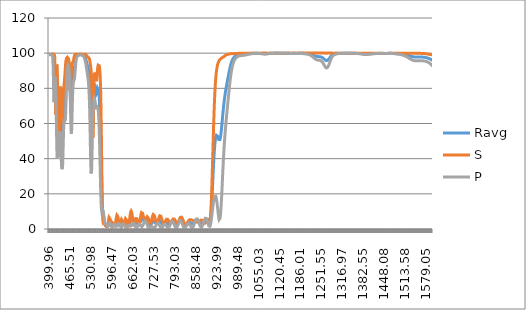
| Category | Ravg | S | P |
|---|---|---|---|
| 399.96 | 99.122 | 99.316 | 98.927 |
| 400.5 | 99.09 | 99.265 | 98.914 |
| 401.04 | 99.071 | 99.243 | 98.899 |
| 401.47 | 99.273 | 99.372 | 99.174 |
| 402.01 | 99.223 | 99.56 | 98.885 |
| 402.45 | 99.273 | 99.512 | 99.034 |
| 402.99 | 99.331 | 99.394 | 99.269 |
| 403.54 | 99.25 | 99.318 | 99.181 |
| 403.99 | 99.254 | 99.291 | 99.216 |
| 404.54 | 99.27 | 99.391 | 99.15 |
| 404.99 | 99.405 | 99.592 | 99.218 |
| 405.55 | 99.257 | 99.347 | 99.167 |
| 406.0 | 99.345 | 99.408 | 99.282 |
| 406.45 | 99.184 | 99.221 | 99.146 |
| 407.02 | 99.304 | 99.446 | 99.161 |
| 407.48 | 99.312 | 99.455 | 99.169 |
| 408.05 | 99.334 | 99.457 | 99.211 |
| 408.51 | 99.267 | 99.46 | 99.073 |
| 408.97 | 99.256 | 99.463 | 99.049 |
| 409.55 | 99.252 | 99.596 | 98.909 |
| 410.02 | 99.202 | 99.521 | 98.883 |
| 410.49 | 99.192 | 99.583 | 98.802 |
| 410.96 | 99.063 | 99.467 | 98.659 |
| 411.55 | 98.876 | 99.539 | 98.214 |
| 412.03 | 98.469 | 99.515 | 97.423 |
| 412.5 | 97.434 | 99.421 | 95.448 |
| 412.98 | 95.631 | 99.43 | 91.833 |
| 413.46 | 92.982 | 99.41 | 86.555 |
| 413.94 | 90.294 | 99.505 | 81.083 |
| 414.55 | 87.675 | 99.445 | 75.905 |
| 415.04 | 86.508 | 99.399 | 73.616 |
| 415.52 | 85.671 | 99.195 | 72.148 |
| 416.01 | 85.919 | 99.231 | 72.608 |
| 416.5 | 87.242 | 99.183 | 75.301 |
| 417.0 | 89.395 | 98.874 | 79.916 |
| 417.49 | 91.118 | 97.95 | 84.286 |
| 417.99 | 91.085 | 95.624 | 86.545 |
| 418.48 | 88.714 | 90.599 | 86.829 |
| 418.98 | 84.529 | 83.057 | 86.001 |
| 419.48 | 80.008 | 75.48 | 84.535 |
| 419.98 | 75.956 | 69.546 | 82.366 |
| 420.49 | 72.862 | 65.849 | 79.875 |
| 420.99 | 71.029 | 65.098 | 76.96 |
| 421.5 | 71.188 | 68.922 | 73.454 |
| 422.0 | 72.854 | 76.214 | 69.495 |
| 422.51 | 74.354 | 83.825 | 64.883 |
| 423.02 | 74.413 | 89.288 | 59.538 |
| 423.53 | 72.859 | 92.103 | 53.616 |
| 424.04 | 70.792 | 93.463 | 48.121 |
| 424.55 | 68.498 | 93.389 | 43.606 |
| 425.06 | 66.817 | 92.749 | 40.884 |
| 425.45 | 65.67 | 91.456 | 39.884 |
| 425.96 | 64.607 | 88.606 | 40.607 |
| 426.48 | 63.541 | 83.951 | 43.131 |
| 426.99 | 62.229 | 77.741 | 46.717 |
| 427.51 | 60.388 | 70.03 | 50.745 |
| 428.03 | 57.966 | 62.011 | 53.92 |
| 428.54 | 54.859 | 54.324 | 55.394 |
| 429.06 | 51.272 | 47.78 | 54.765 |
| 429.45 | 48.627 | 44.25 | 53.004 |
| 429.97 | 45.673 | 41.768 | 49.577 |
| 430.49 | 43.873 | 41.969 | 45.777 |
| 431.01 | 43.565 | 44.498 | 42.632 |
| 431.52 | 44.78 | 48.646 | 40.914 |
| 432.04 | 47.187 | 53.729 | 40.644 |
| 432.56 | 50.956 | 59.54 | 42.373 |
| 432.95 | 54.407 | 64.135 | 44.679 |
| 433.47 | 59.26 | 70.235 | 48.285 |
| 433.99 | 63.562 | 75.397 | 51.727 |
| 434.51 | 66.694 | 79.083 | 54.306 |
| 435.03 | 68.19 | 80.984 | 55.396 |
| 435.55 | 68.162 | 81.458 | 54.866 |
| 435.94 | 67.187 | 80.839 | 53.534 |
| 436.46 | 64.887 | 78.885 | 50.888 |
| 436.97 | 61.715 | 75.891 | 47.539 |
| 437.49 | 58.072 | 72.116 | 44.029 |
| 438.01 | 54.575 | 68.311 | 40.839 |
| 438.52 | 51.474 | 64.821 | 38.126 |
| 439.04 | 48.992 | 61.918 | 36.066 |
| 439.55 | 47.32 | 59.943 | 34.697 |
| 439.94 | 46.741 | 59.442 | 34.041 |
| 440.45 | 46.617 | 59.646 | 33.588 |
| 440.96 | 47.151 | 60.753 | 33.55 |
| 441.48 | 48.353 | 62.702 | 34.003 |
| 441.99 | 50.081 | 65.021 | 35.14 |
| 442.5 | 52.205 | 67.456 | 36.954 |
| 443.0 | 54.787 | 70.006 | 39.567 |
| 443.51 | 57.569 | 72.402 | 42.736 |
| 444.02 | 60.523 | 74.68 | 46.366 |
| 444.52 | 63.406 | 76.648 | 50.164 |
| 445.03 | 66.134 | 78.359 | 53.909 |
| 445.53 | 68.369 | 79.631 | 57.107 |
| 446.03 | 70.159 | 80.729 | 59.589 |
| 446.53 | 71.424 | 81.538 | 61.31 |
| 447.03 | 72.3 | 82.29 | 62.31 |
| 447.52 | 72.913 | 83.16 | 62.666 |
| 448.02 | 73.346 | 84.15 | 62.542 |
| 448.51 | 73.65 | 85.254 | 62.047 |
| 449.0 | 74.009 | 86.531 | 61.488 |
| 449.49 | 74.532 | 87.988 | 61.076 |
| 449.98 | 75.17 | 89.377 | 60.962 |
| 450.47 | 76.022 | 90.773 | 61.271 |
| 450.96 | 77.186 | 92.088 | 62.285 |
| 451.56 | 78.935 | 93.561 | 64.309 |
| 452.04 | 80.531 | 94.477 | 66.584 |
| 452.52 | 82.264 | 95.353 | 69.174 |
| 453.0 | 84.02 | 95.886 | 72.154 |
| 453.48 | 85.759 | 96.294 | 75.223 |
| 453.95 | 87.414 | 96.742 | 78.085 |
| 454.54 | 89.342 | 97.09 | 81.594 |
| 455.01 | 90.672 | 97.361 | 83.984 |
| 455.48 | 91.805 | 97.469 | 86.141 |
| 456.06 | 92.932 | 97.645 | 88.218 |
| 456.52 | 93.61 | 97.645 | 89.574 |
| 456.99 | 94.176 | 97.666 | 90.687 |
| 457.45 | 94.6 | 97.743 | 91.456 |
| 458.02 | 94.977 | 97.644 | 92.31 |
| 458.47 | 95.156 | 97.627 | 92.686 |
| 459.04 | 95.309 | 97.561 | 93.058 |
| 459.49 | 95.224 | 97.347 | 93.101 |
| 460.05 | 95.171 | 97.215 | 93.127 |
| 460.5 | 94.912 | 96.914 | 92.909 |
| 460.95 | 94.654 | 96.717 | 92.591 |
| 461.5 | 94.173 | 96.23 | 92.115 |
| 462.05 | 93.489 | 95.599 | 91.378 |
| 462.49 | 92.739 | 94.797 | 90.681 |
| 463.04 | 91.41 | 93.29 | 89.53 |
| 463.47 | 89.985 | 91.574 | 88.395 |
| 464.01 | 87.682 | 88.607 | 86.757 |
| 464.55 | 85.052 | 85.516 | 84.588 |
| 464.98 | 82.844 | 83.036 | 82.651 |
| 465.51 | 80.265 | 80.802 | 79.729 |
| 466.04 | 77.679 | 79.202 | 76.157 |
| 466.47 | 75.812 | 78.565 | 73.059 |
| 466.99 | 73.682 | 78.558 | 68.806 |
| 467.52 | 72.059 | 79.514 | 64.605 |
| 468.04 | 71.095 | 81.653 | 60.538 |
| 468.46 | 70.891 | 83.885 | 57.897 |
| 468.97 | 71.199 | 86.956 | 55.442 |
| 469.49 | 71.974 | 89.732 | 54.217 |
| 470.0 | 73.072 | 91.683 | 54.462 |
| 470.52 | 74.551 | 93.101 | 56.001 |
| 471.03 | 76.324 | 93.869 | 58.779 |
| 471.54 | 78.302 | 94.331 | 62.274 |
| 472.04 | 80.315 | 94.481 | 66.149 |
| 472.55 | 82.243 | 94.594 | 69.891 |
| 473.05 | 84.017 | 94.587 | 73.447 |
| 473.46 | 85.266 | 94.603 | 75.929 |
| 473.96 | 86.507 | 94.587 | 78.427 |
| 474.46 | 87.52 | 94.722 | 80.318 |
| 474.96 | 88.316 | 94.853 | 81.778 |
| 475.46 | 88.935 | 95.059 | 82.811 |
| 475.96 | 89.52 | 95.534 | 83.506 |
| 476.46 | 89.946 | 95.962 | 83.93 |
| 477.05 | 90.401 | 96.53 | 84.272 |
| 477.55 | 90.735 | 97.088 | 84.382 |
| 478.05 | 91.131 | 97.603 | 84.66 |
| 478.54 | 91.463 | 98.059 | 84.867 |
| 479.04 | 91.869 | 98.437 | 85.301 |
| 479.54 | 92.306 | 98.754 | 85.857 |
| 480.03 | 92.781 | 98.954 | 86.608 |
| 480.53 | 93.303 | 99.058 | 87.548 |
| 481.03 | 93.951 | 99.283 | 88.62 |
| 481.53 | 94.522 | 99.248 | 89.796 |
| 482.03 | 95.174 | 99.361 | 90.988 |
| 482.52 | 95.75 | 99.397 | 92.103 |
| 483.03 | 96.289 | 99.354 | 93.224 |
| 483.53 | 96.84 | 99.433 | 94.248 |
| 484.03 | 97.311 | 99.527 | 95.095 |
| 484.53 | 97.627 | 99.412 | 95.842 |
| 485.04 | 97.85 | 99.359 | 96.342 |
| 485.55 | 98.162 | 99.412 | 96.912 |
| 486.05 | 98.391 | 99.427 | 97.355 |
| 486.46 | 98.483 | 99.401 | 97.565 |
| 486.97 | 98.681 | 99.479 | 97.883 |
| 487.49 | 98.704 | 99.325 | 98.082 |
| 488.0 | 98.807 | 99.375 | 98.238 |
| 488.52 | 98.861 | 99.334 | 98.389 |
| 489.04 | 98.897 | 99.323 | 98.472 |
| 489.45 | 98.949 | 99.276 | 98.622 |
| 489.97 | 98.961 | 99.256 | 98.667 |
| 490.5 | 98.992 | 99.259 | 98.726 |
| 491.03 | 99.015 | 99.242 | 98.789 |
| 491.45 | 99.011 | 99.261 | 98.762 |
| 491.98 | 99.033 | 99.278 | 98.788 |
| 492.52 | 99.054 | 99.267 | 98.842 |
| 493.05 | 99.104 | 99.292 | 98.916 |
| 493.49 | 99.102 | 99.312 | 98.891 |
| 494.03 | 99.129 | 99.372 | 98.887 |
| 494.46 | 99.145 | 99.344 | 98.946 |
| 495.01 | 99.144 | 99.396 | 98.893 |
| 495.45 | 99.217 | 99.475 | 98.96 |
| 496.0 | 99.221 | 99.494 | 98.948 |
| 496.56 | 99.221 | 99.493 | 98.95 |
| 497.0 | 99.181 | 99.389 | 98.972 |
| 497.45 | 99.238 | 99.529 | 98.947 |
| 498.01 | 99.231 | 99.502 | 98.96 |
| 498.46 | 99.266 | 99.539 | 98.994 |
| 499.03 | 99.23 | 99.488 | 98.972 |
| 499.49 | 99.243 | 99.486 | 99 |
| 499.95 | 99.251 | 99.565 | 98.936 |
| 500.52 | 99.241 | 99.474 | 99.008 |
| 500.98 | 99.216 | 99.431 | 99.002 |
| 501.45 | 99.189 | 99.412 | 98.966 |
| 502.03 | 99.145 | 99.403 | 98.887 |
| 502.5 | 99.15 | 99.351 | 98.95 |
| 502.97 | 99.119 | 99.375 | 98.863 |
| 503.56 | 99.049 | 99.26 | 98.837 |
| 504.03 | 99.012 | 99.228 | 98.795 |
| 504.51 | 99.001 | 99.258 | 98.744 |
| 504.99 | 98.937 | 99.178 | 98.695 |
| 505.47 | 98.93 | 99.241 | 98.618 |
| 505.95 | 98.819 | 99.142 | 98.496 |
| 506.55 | 98.788 | 99.206 | 98.369 |
| 507.04 | 98.75 | 99.177 | 98.323 |
| 507.53 | 98.682 | 99.199 | 98.166 |
| 508.02 | 98.647 | 99.24 | 98.054 |
| 508.51 | 98.574 | 99.222 | 97.926 |
| 509.0 | 98.541 | 99.339 | 97.743 |
| 509.49 | 98.441 | 99.292 | 97.589 |
| 509.99 | 98.373 | 99.356 | 97.39 |
| 510.48 | 98.265 | 99.335 | 97.196 |
| 510.98 | 98.107 | 99.339 | 96.876 |
| 511.48 | 98.005 | 99.392 | 96.617 |
| 511.98 | 97.862 | 99.385 | 96.339 |
| 512.48 | 97.72 | 99.424 | 96.016 |
| 512.99 | 97.537 | 99.446 | 95.628 |
| 513.49 | 97.354 | 99.428 | 95.28 |
| 514.0 | 97.069 | 99.33 | 94.807 |
| 514.5 | 96.834 | 99.319 | 94.349 |
| 515.01 | 96.536 | 99.251 | 93.821 |
| 515.52 | 96.227 | 99.179 | 93.275 |
| 516.03 | 95.879 | 99.053 | 92.704 |
| 516.54 | 95.529 | 98.975 | 92.083 |
| 517.05 | 95.147 | 98.817 | 91.478 |
| 517.56 | 94.764 | 98.662 | 90.867 |
| 517.95 | 94.417 | 98.521 | 90.314 |
| 518.46 | 94.013 | 98.313 | 89.713 |
| 518.97 | 93.619 | 98.143 | 89.094 |
| 519.49 | 93.205 | 97.995 | 88.416 |
| 520.0 | 92.846 | 97.87 | 87.822 |
| 520.52 | 92.463 | 97.778 | 87.149 |
| 521.04 | 92.13 | 97.693 | 86.566 |
| 521.55 | 91.764 | 97.729 | 85.8 |
| 521.94 | 91.405 | 97.62 | 85.19 |
| 522.46 | 91.051 | 97.667 | 84.435 |
| 522.98 | 90.603 | 97.702 | 83.505 |
| 523.49 | 90 | 97.653 | 82.347 |
| 524.01 | 89.286 | 97.558 | 81.015 |
| 524.53 | 88.486 | 97.453 | 79.519 |
| 525.05 | 87.508 | 97.338 | 77.678 |
| 525.56 | 86.241 | 97.093 | 75.389 |
| 525.95 | 85.144 | 96.816 | 73.473 |
| 526.47 | 83.487 | 96.495 | 70.478 |
| 526.98 | 81.468 | 96.07 | 66.867 |
| 527.5 | 79.165 | 95.513 | 62.818 |
| 528.02 | 76.559 | 94.885 | 58.233 |
| 528.53 | 73.772 | 94.281 | 53.263 |
| 529.05 | 70.922 | 93.63 | 48.214 |
| 529.56 | 68.134 | 92.929 | 43.339 |
| 529.95 | 66.262 | 92.414 | 40.11 |
| 530.46 | 63.936 | 91.621 | 36.251 |
| 530.98 | 62.095 | 90.814 | 33.377 |
| 531.49 | 60.737 | 89.853 | 31.621 |
| 532.0 | 59.906 | 88.665 | 31.147 |
| 532.51 | 59.356 | 86.923 | 31.789 |
| 533.02 | 59.144 | 84.594 | 33.693 |
| 533.53 | 58.785 | 81.092 | 36.477 |
| 534.04 | 58.267 | 76.244 | 40.29 |
| 534.54 | 57.425 | 70.346 | 44.504 |
| 535.05 | 56.601 | 64.255 | 48.947 |
| 535.55 | 56.13 | 59.007 | 53.253 |
| 536.05 | 56.222 | 55.094 | 57.349 |
| 536.56 | 56.93 | 52.916 | 60.945 |
| 537.06 | 58.072 | 52.141 | 64.004 |
| 537.56 | 59.783 | 52.895 | 66.671 |
| 538.05 | 62.159 | 55.468 | 68.85 |
| 538.55 | 65.394 | 60.214 | 70.574 |
| 539.04 | 69.103 | 66.287 | 71.92 |
| 539.54 | 72.83 | 72.719 | 72.942 |
| 540.03 | 75.927 | 78.224 | 73.63 |
| 540.52 | 78.279 | 82.496 | 74.062 |
| 541.01 | 79.795 | 85.278 | 74.313 |
| 541.49 | 80.762 | 87.164 | 74.36 |
| 541.98 | 81.197 | 88.188 | 74.206 |
| 542.46 | 81.334 | 88.7 | 73.968 |
| 543.06 | 81.177 | 88.931 | 73.423 |
| 543.54 | 80.765 | 88.614 | 72.917 |
| 544.02 | 80.258 | 88.153 | 72.362 |
| 544.5 | 79.589 | 87.462 | 71.716 |
| 544.97 | 78.913 | 86.69 | 71.136 |
| 545.56 | 78.077 | 85.717 | 70.437 |
| 546.03 | 77.495 | 85.024 | 69.966 |
| 546.5 | 77.047 | 84.497 | 69.598 |
| 546.97 | 76.67 | 84.071 | 69.268 |
| 547.55 | 76.472 | 83.924 | 69.021 |
| 548.01 | 76.504 | 84.09 | 68.919 |
| 548.47 | 76.719 | 84.52 | 68.918 |
| 549.04 | 77.204 | 85.371 | 69.036 |
| 549.5 | 77.719 | 86.262 | 69.176 |
| 549.95 | 78.254 | 87.219 | 69.289 |
| 550.51 | 79.021 | 88.629 | 69.413 |
| 550.96 | 79.548 | 89.629 | 69.468 |
| 551.52 | 80.135 | 90.793 | 69.476 |
| 551.97 | 80.425 | 91.542 | 69.307 |
| 552.52 | 80.644 | 92.304 | 68.983 |
| 552.96 | 80.647 | 92.757 | 68.537 |
| 553.51 | 80.496 | 93.176 | 67.816 |
| 553.95 | 80.225 | 93.464 | 66.986 |
| 554.49 | 79.636 | 93.614 | 65.659 |
| 555.03 | 78.879 | 93.693 | 64.065 |
| 555.46 | 78.085 | 93.602 | 62.567 |
| 556.0 | 76.893 | 93.479 | 60.307 |
| 556.53 | 75.446 | 93.19 | 57.702 |
| 556.96 | 74.043 | 92.824 | 55.262 |
| 557.48 | 72.082 | 92.267 | 51.897 |
| 558.01 | 69.847 | 91.46 | 48.233 |
| 558.53 | 67.391 | 90.533 | 44.248 |
| 558.95 | 65.233 | 89.507 | 40.958 |
| 559.47 | 62.359 | 87.925 | 36.792 |
| 559.99 | 59.134 | 85.856 | 32.413 |
| 560.5 | 55.788 | 83.228 | 28.349 |
| 561.02 | 52.212 | 79.991 | 24.433 |
| 561.53 | 48.427 | 75.96 | 20.894 |
| 562.04 | 44.406 | 71.073 | 17.738 |
| 562.55 | 40.127 | 65.159 | 15.095 |
| 563.05 | 35.893 | 58.7 | 13.087 |
| 563.46 | 32.474 | 53.104 | 11.844 |
| 563.96 | 28.317 | 45.843 | 10.791 |
| 564.46 | 24.332 | 38.45 | 10.215 |
| 564.96 | 20.677 | 31.323 | 10.031 |
| 565.46 | 17.489 | 24.84 | 10.138 |
| 565.96 | 14.724 | 19.047 | 10.401 |
| 566.46 | 12.351 | 13.927 | 10.775 |
| 567.05 | 10.266 | 9.398 | 11.135 |
| 567.55 | 9.098 | 6.876 | 11.32 |
| 568.04 | 8.318 | 5.302 | 11.334 |
| 568.54 | 7.904 | 4.644 | 11.164 |
| 569.03 | 7.681 | 4.567 | 10.796 |
| 569.53 | 7.576 | 4.859 | 10.293 |
| 570.02 | 7.388 | 5.17 | 9.606 |
| 570.51 | 7.088 | 5.389 | 8.788 |
| 571.01 | 6.677 | 5.423 | 7.93 |
| 571.5 | 6.166 | 5.277 | 7.056 |
| 572.0 | 5.537 | 4.931 | 6.143 |
| 572.49 | 4.9 | 4.505 | 5.295 |
| 572.99 | 4.271 | 3.967 | 4.574 |
| 573.48 | 3.691 | 3.435 | 3.948 |
| 573.98 | 3.189 | 2.976 | 3.402 |
| 574.48 | 2.796 | 2.546 | 3.046 |
| 574.98 | 2.504 | 2.243 | 2.764 |
| 575.48 | 2.322 | 2.013 | 2.631 |
| 575.98 | 2.213 | 1.864 | 2.561 |
| 576.48 | 2.172 | 1.756 | 2.588 |
| 576.99 | 2.174 | 1.707 | 2.641 |
| 577.49 | 2.185 | 1.632 | 2.738 |
| 578.0 | 2.213 | 1.608 | 2.819 |
| 578.51 | 2.184 | 1.52 | 2.849 |
| 579.02 | 2.121 | 1.385 | 2.858 |
| 579.53 | 2.041 | 1.287 | 2.794 |
| 580.05 | 1.907 | 1.133 | 2.682 |
| 580.46 | 1.802 | 1.043 | 2.561 |
| 580.98 | 1.683 | 0.998 | 2.368 |
| 581.5 | 1.615 | 1.067 | 2.164 |
| 582.03 | 1.529 | 1.145 | 1.913 |
| 582.55 | 1.538 | 1.367 | 1.709 |
| 582.97 | 1.602 | 1.642 | 1.562 |
| 583.5 | 1.751 | 2.077 | 1.426 |
| 584.04 | 2.016 | 2.67 | 1.361 |
| 584.46 | 2.25 | 3.166 | 1.334 |
| 585.0 | 2.609 | 3.836 | 1.383 |
| 585.54 | 3.038 | 4.575 | 1.502 |
| 585.98 | 3.379 | 5.093 | 1.666 |
| 586.52 | 3.794 | 5.7 | 1.887 |
| 586.96 | 4.121 | 6.14 | 2.101 |
| 587.51 | 4.476 | 6.545 | 2.408 |
| 587.95 | 4.722 | 6.794 | 2.649 |
| 588.51 | 4.931 | 6.934 | 2.928 |
| 588.95 | 5.034 | 6.923 | 3.145 |
| 589.52 | 5.042 | 6.731 | 3.352 |
| 589.97 | 4.968 | 6.442 | 3.495 |
| 590.53 | 4.789 | 5.98 | 3.599 |
| 590.99 | 4.546 | 5.508 | 3.585 |
| 591.56 | 4.192 | 4.883 | 3.501 |
| 592.02 | 3.861 | 4.334 | 3.389 |
| 592.48 | 3.504 | 3.8 | 3.207 |
| 593.06 | 3.088 | 3.237 | 2.939 |
| 593.52 | 2.759 | 2.843 | 2.675 |
| 593.99 | 2.459 | 2.529 | 2.39 |
| 594.46 | 2.189 | 2.288 | 2.089 |
| 595.05 | 1.937 | 2.136 | 1.738 |
| 595.52 | 1.816 | 2.153 | 1.479 |
| 596.0 | 1.725 | 2.193 | 1.257 |
| 596.47 | 1.729 | 2.37 | 1.087 |
| 596.95 | 1.749 | 2.548 | 0.951 |
| 597.55 | 1.872 | 2.839 | 0.904 |
| 598.04 | 1.986 | 3.068 | 0.904 |
| 598.52 | 2.135 | 3.282 | 0.988 |
| 599.01 | 2.29 | 3.456 | 1.123 |
| 599.49 | 2.401 | 3.55 | 1.253 |
| 599.98 | 2.524 | 3.604 | 1.444 |
| 600.47 | 2.656 | 3.624 | 1.689 |
| 600.96 | 2.705 | 3.485 | 1.924 |
| 601.46 | 2.751 | 3.349 | 2.154 |
| 601.95 | 2.754 | 3.133 | 2.374 |
| 602.45 | 2.733 | 2.885 | 2.581 |
| 602.95 | 2.679 | 2.631 | 2.726 |
| 603.45 | 2.61 | 2.38 | 2.841 |
| 603.95 | 2.522 | 2.157 | 2.886 |
| 604.45 | 2.479 | 2.035 | 2.923 |
| 604.95 | 2.421 | 1.966 | 2.876 |
| 605.45 | 2.435 | 2.097 | 2.773 |
| 605.96 | 2.446 | 2.234 | 2.658 |
| 606.46 | 2.479 | 2.477 | 2.481 |
| 606.97 | 2.583 | 2.86 | 2.306 |
| 607.48 | 2.699 | 3.274 | 2.124 |
| 607.99 | 2.858 | 3.795 | 1.921 |
| 608.5 | 3.064 | 4.377 | 1.751 |
| 609.01 | 3.289 | 4.995 | 1.583 |
| 609.52 | 3.525 | 5.587 | 1.463 |
| 610.03 | 3.786 | 6.21 | 1.361 |
| 610.54 | 4.041 | 6.775 | 1.306 |
| 611.06 | 4.289 | 7.262 | 1.316 |
| 611.44 | 4.464 | 7.585 | 1.344 |
| 611.95 | 4.66 | 7.899 | 1.422 |
| 612.47 | 4.819 | 8.094 | 1.545 |
| 612.98 | 4.911 | 8.123 | 1.698 |
| 613.5 | 4.98 | 8.07 | 1.889 |
| 614.01 | 4.99 | 7.885 | 2.095 |
| 614.53 | 4.914 | 7.519 | 2.309 |
| 615.04 | 4.817 | 7.103 | 2.53 |
| 615.56 | 4.68 | 6.624 | 2.736 |
| 615.95 | 4.522 | 6.169 | 2.874 |
| 616.46 | 4.293 | 5.55 | 3.036 |
| 616.98 | 4.044 | 4.937 | 3.15 |
| 617.49 | 3.79 | 4.351 | 3.229 |
| 618.01 | 3.514 | 3.783 | 3.244 |
| 618.52 | 3.26 | 3.3 | 3.22 |
| 619.03 | 3.037 | 2.93 | 3.143 |
| 619.55 | 2.844 | 2.668 | 3.021 |
| 620.06 | 2.681 | 2.51 | 2.852 |
| 620.45 | 2.6 | 2.507 | 2.693 |
| 620.96 | 2.512 | 2.557 | 2.467 |
| 621.47 | 2.471 | 2.706 | 2.236 |
| 621.98 | 2.481 | 2.972 | 1.99 |
| 622.49 | 2.521 | 3.309 | 1.732 |
| 623.0 | 2.592 | 3.689 | 1.496 |
| 623.51 | 2.693 | 4.092 | 1.293 |
| 624.01 | 2.809 | 4.488 | 1.131 |
| 624.52 | 2.93 | 4.843 | 1.017 |
| 625.03 | 3.031 | 5.126 | 0.937 |
| 625.53 | 3.133 | 5.352 | 0.914 |
| 626.03 | 3.222 | 5.505 | 0.938 |
| 626.54 | 3.263 | 5.511 | 1.015 |
| 627.04 | 3.3 | 5.474 | 1.125 |
| 627.54 | 3.305 | 5.323 | 1.286 |
| 628.04 | 3.261 | 5.064 | 1.457 |
| 628.53 | 3.21 | 4.749 | 1.67 |
| 629.03 | 3.139 | 4.397 | 1.881 |
| 629.52 | 3.058 | 4.014 | 2.103 |
| 630.02 | 2.948 | 3.591 | 2.306 |
| 630.51 | 2.861 | 3.213 | 2.509 |
| 631.0 | 2.764 | 2.859 | 2.67 |
| 631.48 | 2.68 | 2.552 | 2.807 |
| 631.97 | 2.626 | 2.336 | 2.917 |
| 632.46 | 2.554 | 2.145 | 2.964 |
| 633.06 | 2.54 | 2.095 | 2.986 |
| 633.54 | 2.556 | 2.156 | 2.956 |
| 634.02 | 2.587 | 2.294 | 2.881 |
| 634.5 | 2.638 | 2.51 | 2.765 |
| 634.97 | 2.711 | 2.794 | 2.627 |
| 635.45 | 2.814 | 3.169 | 2.459 |
| 636.04 | 2.96 | 3.68 | 2.239 |
| 636.51 | 3.062 | 4.085 | 2.038 |
| 636.98 | 3.177 | 4.505 | 1.848 |
| 637.56 | 3.291 | 4.981 | 1.601 |
| 638.02 | 3.376 | 5.339 | 1.414 |
| 638.48 | 3.444 | 5.636 | 1.252 |
| 639.06 | 3.496 | 5.913 | 1.078 |
| 639.52 | 3.504 | 6.04 | 0.967 |
| 639.97 | 3.494 | 6.107 | 0.88 |
| 640.54 | 3.434 | 6.07 | 0.798 |
| 640.99 | 3.366 | 5.942 | 0.79 |
| 641.55 | 3.267 | 5.736 | 0.798 |
| 642.0 | 3.148 | 5.475 | 0.82 |
| 642.55 | 2.978 | 5.057 | 0.899 |
| 643.0 | 2.829 | 4.683 | 0.976 |
| 643.55 | 2.642 | 4.191 | 1.093 |
| 643.99 | 2.488 | 3.779 | 1.197 |
| 644.53 | 2.313 | 3.291 | 1.335 |
| 644.97 | 2.183 | 2.914 | 1.452 |
| 645.51 | 2.042 | 2.482 | 1.603 |
| 646.05 | 1.941 | 2.148 | 1.733 |
| 646.47 | 1.877 | 1.919 | 1.836 |
| 647.01 | 1.864 | 1.786 | 1.942 |
| 647.54 | 1.883 | 1.741 | 2.026 |
| 647.96 | 1.945 | 1.808 | 2.082 |
| 648.48 | 2.057 | 1.987 | 2.127 |
| 649.01 | 2.231 | 2.333 | 2.129 |
| 649.53 | 2.452 | 2.766 | 2.137 |
| 650.05 | 2.7 | 3.286 | 2.114 |
| 650.46 | 2.932 | 3.784 | 2.08 |
| 650.97 | 3.235 | 4.444 | 2.026 |
| 651.49 | 3.551 | 5.146 | 1.956 |
| 652.0 | 3.9 | 5.915 | 1.884 |
| 652.51 | 4.238 | 6.663 | 1.814 |
| 653.01 | 4.563 | 7.381 | 1.744 |
| 653.52 | 4.86 | 8.043 | 1.676 |
| 654.02 | 5.135 | 8.638 | 1.633 |
| 654.52 | 5.388 | 9.171 | 1.605 |
| 655.02 | 5.609 | 9.622 | 1.596 |
| 655.52 | 5.772 | 9.95 | 1.594 |
| 656.02 | 5.884 | 10.129 | 1.639 |
| 656.51 | 5.946 | 10.201 | 1.691 |
| 657.01 | 5.975 | 10.173 | 1.778 |
| 657.5 | 5.951 | 10.016 | 1.887 |
| 658.0 | 5.877 | 9.752 | 2.001 |
| 658.49 | 5.75 | 9.365 | 2.134 |
| 658.98 | 5.597 | 8.909 | 2.285 |
| 659.47 | 5.398 | 8.345 | 2.45 |
| 659.96 | 5.181 | 7.76 | 2.602 |
| 660.55 | 4.888 | 6.99 | 2.786 |
| 661.04 | 4.632 | 6.337 | 2.927 |
| 661.53 | 4.372 | 5.707 | 3.037 |
| 662.03 | 4.111 | 5.079 | 3.143 |
| 662.52 | 3.855 | 4.478 | 3.232 |
| 663.01 | 3.623 | 3.975 | 3.272 |
| 663.5 | 3.408 | 3.53 | 3.286 |
| 663.99 | 3.241 | 3.186 | 3.297 |
| 664.49 | 3.084 | 2.934 | 3.234 |
| 664.98 | 2.96 | 2.781 | 3.138 |
| 665.48 | 2.898 | 2.755 | 3.041 |
| 665.97 | 2.855 | 2.805 | 2.904 |
| 666.47 | 2.839 | 2.95 | 2.728 |
| 666.97 | 2.844 | 3.154 | 2.535 |
| 667.47 | 2.891 | 3.452 | 2.33 |
| 667.97 | 2.961 | 3.806 | 2.116 |
| 668.47 | 3.04 | 4.198 | 1.882 |
| 668.98 | 3.123 | 4.582 | 1.663 |
| 669.48 | 3.21 | 4.977 | 1.443 |
| 669.99 | 3.302 | 5.349 | 1.256 |
| 670.5 | 3.365 | 5.661 | 1.07 |
| 671.01 | 3.438 | 5.951 | 0.925 |
| 671.53 | 3.482 | 6.161 | 0.802 |
| 672.05 | 3.5 | 6.283 | 0.717 |
| 672.46 | 3.503 | 6.336 | 0.67 |
| 672.98 | 3.49 | 6.323 | 0.658 |
| 673.5 | 3.438 | 6.197 | 0.679 |
| 674.03 | 3.371 | 6.015 | 0.727 |
| 674.45 | 3.319 | 5.834 | 0.805 |
| 674.98 | 3.233 | 5.536 | 0.93 |
| 675.52 | 3.131 | 5.18 | 1.082 |
| 676.05 | 3.027 | 4.787 | 1.266 |
| 676.48 | 2.932 | 4.459 | 1.406 |
| 677.02 | 2.825 | 4.04 | 1.61 |
| 677.46 | 2.735 | 3.703 | 1.767 |
| 678.0 | 2.657 | 3.345 | 1.969 |
| 678.55 | 2.57 | 2.985 | 2.155 |
| 678.99 | 2.545 | 2.788 | 2.302 |
| 679.54 | 2.537 | 2.613 | 2.461 |
| 679.99 | 2.541 | 2.504 | 2.577 |
| 680.55 | 2.591 | 2.501 | 2.681 |
| 681.0 | 2.661 | 2.568 | 2.753 |
| 681.45 | 2.748 | 2.711 | 2.785 |
| 682.01 | 2.88 | 2.946 | 2.814 |
| 682.47 | 3.022 | 3.257 | 2.788 |
| 683.04 | 3.218 | 3.719 | 2.717 |
| 683.5 | 3.412 | 4.145 | 2.679 |
| 683.96 | 3.594 | 4.624 | 2.564 |
| 684.54 | 3.848 | 5.253 | 2.443 |
| 685.01 | 4.064 | 5.818 | 2.31 |
| 685.47 | 4.255 | 6.332 | 2.178 |
| 686.06 | 4.498 | 6.986 | 2.01 |
| 686.53 | 4.671 | 7.489 | 1.853 |
| 687.01 | 4.82 | 7.915 | 1.726 |
| 687.48 | 4.974 | 8.36 | 1.588 |
| 687.96 | 5.098 | 8.714 | 1.483 |
| 688.56 | 5.218 | 9.07 | 1.366 |
| 689.04 | 5.317 | 9.328 | 1.305 |
| 689.52 | 5.383 | 9.494 | 1.271 |
| 690.0 | 5.408 | 9.56 | 1.255 |
| 690.49 | 5.422 | 9.567 | 1.277 |
| 690.98 | 5.407 | 9.497 | 1.317 |
| 691.46 | 5.383 | 9.359 | 1.407 |
| 691.96 | 5.35 | 9.165 | 1.535 |
| 692.45 | 5.292 | 8.908 | 1.676 |
| 693.06 | 5.215 | 8.535 | 1.894 |
| 693.56 | 5.122 | 8.151 | 2.094 |
| 694.05 | 5.05 | 7.791 | 2.31 |
| 694.55 | 4.979 | 7.405 | 2.553 |
| 695.05 | 4.896 | 7.001 | 2.791 |
| 695.55 | 4.829 | 6.626 | 3.032 |
| 696.05 | 4.757 | 6.245 | 3.27 |
| 696.55 | 4.702 | 5.89 | 3.514 |
| 697.06 | 4.668 | 5.592 | 3.744 |
| 697.56 | 4.638 | 5.334 | 3.942 |
| 697.94 | 4.621 | 5.168 | 4.074 |
| 698.44 | 4.62 | 5.001 | 4.239 |
| 698.95 | 4.627 | 4.874 | 4.38 |
| 699.46 | 4.65 | 4.821 | 4.48 |
| 699.97 | 4.687 | 4.83 | 4.543 |
| 700.48 | 4.72 | 4.868 | 4.573 |
| 700.98 | 4.78 | 4.985 | 4.575 |
| 701.49 | 4.837 | 5.136 | 4.538 |
| 702.01 | 4.884 | 5.322 | 4.446 |
| 702.52 | 4.935 | 5.532 | 4.338 |
| 703.03 | 4.968 | 5.754 | 4.181 |
| 703.54 | 5.001 | 5.989 | 4.013 |
| 704.05 | 5 | 6.216 | 3.784 |
| 704.56 | 5 | 6.433 | 3.566 |
| 704.95 | 4.991 | 6.609 | 3.372 |
| 705.46 | 4.947 | 6.782 | 3.113 |
| 705.97 | 4.881 | 6.923 | 2.84 |
| 706.49 | 4.793 | 7.02 | 2.567 |
| 707.0 | 4.683 | 7.081 | 2.285 |
| 707.51 | 4.538 | 7.066 | 2.009 |
| 708.02 | 4.385 | 7.025 | 1.745 |
| 708.54 | 4.199 | 6.899 | 1.499 |
| 709.05 | 4.006 | 6.74 | 1.272 |
| 709.56 | 3.796 | 6.515 | 1.077 |
| 709.94 | 3.631 | 6.331 | 0.931 |
| 710.45 | 3.418 | 6.051 | 0.785 |
| 710.96 | 3.189 | 5.729 | 0.649 |
| 711.47 | 2.966 | 5.372 | 0.559 |
| 711.98 | 2.755 | 5.031 | 0.48 |
| 712.49 | 2.556 | 4.662 | 0.449 |
| 713.0 | 2.374 | 4.3 | 0.449 |
| 713.5 | 2.221 | 3.985 | 0.457 |
| 714.01 | 2.08 | 3.659 | 0.501 |
| 714.52 | 1.976 | 3.391 | 0.562 |
| 715.02 | 1.923 | 3.187 | 0.658 |
| 715.52 | 1.882 | 3.031 | 0.733 |
| 716.03 | 1.877 | 2.93 | 0.824 |
| 716.53 | 1.914 | 2.904 | 0.924 |
| 717.03 | 1.99 | 2.948 | 1.032 |
| 717.52 | 2.078 | 3.043 | 1.114 |
| 718.02 | 2.198 | 3.194 | 1.202 |
| 718.52 | 2.345 | 3.424 | 1.267 |
| 719.01 | 2.509 | 3.69 | 1.327 |
| 719.51 | 2.703 | 4.032 | 1.375 |
| 720.0 | 2.907 | 4.406 | 1.409 |
| 720.49 | 3.101 | 4.795 | 1.407 |
| 720.98 | 3.3 | 5.189 | 1.41 |
| 721.46 | 3.506 | 5.614 | 1.398 |
| 721.95 | 3.699 | 6.039 | 1.36 |
| 722.56 | 3.926 | 6.555 | 1.298 |
| 723.04 | 4.074 | 6.909 | 1.238 |
| 723.52 | 4.215 | 7.259 | 1.171 |
| 724.0 | 4.332 | 7.571 | 1.093 |
| 724.47 | 4.42 | 7.816 | 1.024 |
| 724.95 | 4.487 | 8.034 | 0.941 |
| 725.54 | 4.541 | 8.228 | 0.854 |
| 726.01 | 4.552 | 8.32 | 0.784 |
| 726.48 | 4.561 | 8.367 | 0.755 |
| 726.95 | 4.513 | 8.337 | 0.689 |
| 727.53 | 4.444 | 8.225 | 0.664 |
| 728.0 | 4.389 | 8.115 | 0.663 |
| 728.46 | 4.313 | 7.958 | 0.668 |
| 729.03 | 4.177 | 7.661 | 0.694 |
| 729.49 | 4.072 | 7.384 | 0.761 |
| 730.06 | 3.946 | 7.042 | 0.849 |
| 730.51 | 3.82 | 6.719 | 0.92 |
| 730.96 | 3.71 | 6.399 | 1.021 |
| 731.52 | 3.568 | 5.975 | 1.16 |
| 731.97 | 3.468 | 5.643 | 1.294 |
| 732.52 | 3.332 | 5.201 | 1.463 |
| 732.97 | 3.261 | 4.907 | 1.615 |
| 733.52 | 3.173 | 4.544 | 1.803 |
| 733.96 | 3.109 | 4.264 | 1.955 |
| 734.5 | 3.061 | 3.978 | 2.145 |
| 735.04 | 3.034 | 3.727 | 2.341 |
| 735.47 | 3.02 | 3.578 | 2.462 |
| 736.01 | 3.035 | 3.428 | 2.642 |
| 736.55 | 3.08 | 3.351 | 2.81 |
| 736.97 | 3.118 | 3.302 | 2.933 |
| 737.5 | 3.19 | 3.312 | 3.068 |
| 738.03 | 3.274 | 3.399 | 3.149 |
| 738.55 | 3.393 | 3.537 | 3.25 |
| 738.97 | 3.475 | 3.665 | 3.286 |
| 739.49 | 3.617 | 3.913 | 3.321 |
| 740.01 | 3.741 | 4.15 | 3.331 |
| 740.52 | 3.884 | 4.451 | 3.317 |
| 741.03 | 4.029 | 4.786 | 3.272 |
| 741.54 | 4.155 | 5.095 | 3.216 |
| 742.05 | 4.264 | 5.413 | 3.114 |
| 742.46 | 4.371 | 5.713 | 3.028 |
| 742.96 | 4.467 | 6.034 | 2.9 |
| 743.47 | 4.55 | 6.355 | 2.745 |
| 743.97 | 4.63 | 6.659 | 2.601 |
| 744.47 | 4.669 | 6.925 | 2.413 |
| 744.96 | 4.698 | 7.164 | 2.231 |
| 745.46 | 4.697 | 7.354 | 2.041 |
| 745.96 | 4.672 | 7.499 | 1.845 |
| 746.55 | 4.621 | 7.63 | 1.613 |
| 747.04 | 4.578 | 7.717 | 1.439 |
| 747.53 | 4.492 | 7.713 | 1.27 |
| 748.02 | 4.384 | 7.663 | 1.104 |
| 748.51 | 4.276 | 7.572 | 0.979 |
| 749.0 | 4.152 | 7.452 | 0.852 |
| 749.49 | 4.014 | 7.288 | 0.741 |
| 749.98 | 3.869 | 7.073 | 0.664 |
| 750.47 | 3.734 | 6.858 | 0.611 |
| 751.05 | 3.531 | 6.477 | 0.585 |
| 751.54 | 3.382 | 6.181 | 0.583 |
| 752.03 | 3.225 | 5.842 | 0.607 |
| 752.51 | 3.09 | 5.52 | 0.66 |
| 753.0 | 2.962 | 5.187 | 0.737 |
| 753.49 | 2.835 | 4.837 | 0.834 |
| 753.98 | 2.732 | 4.504 | 0.959 |
| 754.47 | 2.633 | 4.186 | 1.08 |
| 754.96 | 2.579 | 3.924 | 1.235 |
| 755.55 | 2.516 | 3.611 | 1.422 |
| 756.04 | 2.473 | 3.367 | 1.578 |
| 756.53 | 2.452 | 3.151 | 1.753 |
| 757.03 | 2.474 | 3.025 | 1.923 |
| 757.52 | 2.488 | 2.895 | 2.081 |
| 758.02 | 2.546 | 2.839 | 2.252 |
| 758.52 | 2.593 | 2.8 | 2.386 |
| 759.02 | 2.673 | 2.83 | 2.515 |
| 759.52 | 2.755 | 2.889 | 2.621 |
| 760.02 | 2.853 | 2.99 | 2.717 |
| 760.53 | 2.958 | 3.124 | 2.791 |
| 761.04 | 3.056 | 3.281 | 2.83 |
| 761.55 | 3.155 | 3.458 | 2.851 |
| 761.95 | 3.252 | 3.646 | 2.857 |
| 762.47 | 3.344 | 3.855 | 2.832 |
| 762.98 | 3.43 | 4.082 | 2.777 |
| 763.5 | 3.505 | 4.308 | 2.702 |
| 764.02 | 3.574 | 4.544 | 2.604 |
| 764.55 | 3.629 | 4.768 | 2.491 |
| 764.97 | 3.662 | 4.945 | 2.38 |
| 765.49 | 3.673 | 5.123 | 2.222 |
| 766.02 | 3.69 | 5.301 | 2.078 |
| 766.45 | 3.675 | 5.422 | 1.928 |
| 766.98 | 3.638 | 5.536 | 1.741 |
| 767.52 | 3.6 | 5.627 | 1.573 |
| 767.95 | 3.547 | 5.67 | 1.423 |
| 768.5 | 3.487 | 5.729 | 1.246 |
| 769.04 | 3.413 | 5.741 | 1.085 |
| 769.48 | 3.334 | 5.708 | 0.96 |
| 770.03 | 3.23 | 5.632 | 0.827 |
| 770.48 | 3.142 | 5.548 | 0.735 |
| 771.03 | 3.035 | 5.433 | 0.637 |
| 771.48 | 2.953 | 5.322 | 0.584 |
| 772.04 | 2.856 | 5.161 | 0.551 |
| 772.49 | 2.77 | 4.996 | 0.545 |
| 772.95 | 2.711 | 4.867 | 0.556 |
| 773.52 | 2.637 | 4.651 | 0.623 |
| 773.97 | 2.595 | 4.498 | 0.691 |
| 774.55 | 2.565 | 4.322 | 0.809 |
| 775.01 | 2.548 | 4.167 | 0.929 |
| 775.47 | 2.548 | 4.029 | 1.067 |
| 776.05 | 2.572 | 3.859 | 1.286 |
| 776.52 | 2.61 | 3.761 | 1.459 |
| 776.99 | 2.66 | 3.652 | 1.667 |
| 777.46 | 2.729 | 3.594 | 1.863 |
| 778.05 | 2.84 | 3.539 | 2.141 |
| 778.53 | 2.949 | 3.523 | 2.375 |
| 779.01 | 3.065 | 3.537 | 2.592 |
| 779.49 | 3.179 | 3.548 | 2.809 |
| 779.97 | 3.325 | 3.614 | 3.036 |
| 780.45 | 3.475 | 3.706 | 3.245 |
| 781.05 | 3.656 | 3.818 | 3.494 |
| 781.54 | 3.793 | 3.921 | 3.664 |
| 782.02 | 3.951 | 4.063 | 3.839 |
| 782.51 | 4.086 | 4.203 | 3.969 |
| 783.0 | 4.234 | 4.371 | 4.098 |
| 783.49 | 4.367 | 4.54 | 4.194 |
| 783.99 | 4.491 | 4.707 | 4.275 |
| 784.48 | 4.591 | 4.864 | 4.318 |
| 784.97 | 4.674 | 5.027 | 4.321 |
| 785.47 | 4.754 | 5.193 | 4.315 |
| 785.97 | 4.809 | 5.34 | 4.278 |
| 786.47 | 4.844 | 5.486 | 4.203 |
| 786.97 | 4.854 | 5.601 | 4.106 |
| 787.47 | 4.835 | 5.688 | 3.982 |
| 787.97 | 4.805 | 5.78 | 3.83 |
| 788.47 | 4.745 | 5.823 | 3.666 |
| 788.97 | 4.67 | 5.868 | 3.472 |
| 789.48 | 4.568 | 5.86 | 3.275 |
| 789.98 | 4.459 | 5.864 | 3.054 |
| 790.49 | 4.322 | 5.82 | 2.823 |
| 791.0 | 4.179 | 5.753 | 2.606 |
| 791.5 | 4.014 | 5.655 | 2.373 |
| 792.01 | 3.841 | 5.546 | 2.135 |
| 792.52 | 3.648 | 5.405 | 1.891 |
| 793.03 | 3.481 | 5.287 | 1.674 |
| 793.53 | 3.302 | 5.145 | 1.46 |
| 794.04 | 3.112 | 4.949 | 1.274 |
| 794.55 | 2.933 | 4.771 | 1.095 |
| 795.06 | 2.765 | 4.588 | 0.942 |
| 795.44 | 2.647 | 4.449 | 0.845 |
| 795.95 | 2.506 | 4.268 | 0.743 |
| 796.46 | 2.369 | 4.075 | 0.664 |
| 796.97 | 2.259 | 3.905 | 0.613 |
| 797.48 | 2.179 | 3.757 | 0.601 |
| 797.99 | 2.124 | 3.637 | 0.61 |
| 798.5 | 2.094 | 3.517 | 0.671 |
| 799.01 | 2.091 | 3.424 | 0.758 |
| 799.52 | 2.117 | 3.35 | 0.884 |
| 800.03 | 2.163 | 3.31 | 1.015 |
| 800.54 | 2.244 | 3.311 | 1.177 |
| 801.04 | 2.352 | 3.318 | 1.386 |
| 801.55 | 2.482 | 3.358 | 1.607 |
| 802.05 | 2.633 | 3.438 | 1.828 |
| 802.56 | 2.807 | 3.539 | 2.075 |
| 803.06 | 3 | 3.657 | 2.343 |
| 803.44 | 3.156 | 3.78 | 2.532 |
| 803.95 | 3.362 | 3.933 | 2.792 |
| 804.45 | 3.591 | 4.112 | 3.069 |
| 804.95 | 3.828 | 4.351 | 3.305 |
| 805.45 | 4.059 | 4.559 | 3.558 |
| 805.95 | 4.292 | 4.792 | 3.792 |
| 806.45 | 4.511 | 5.007 | 4.016 |
| 806.94 | 4.724 | 5.232 | 4.216 |
| 807.56 | 4.972 | 5.522 | 4.422 |
| 808.06 | 5.165 | 5.749 | 4.582 |
| 808.55 | 5.319 | 5.948 | 4.69 |
| 809.04 | 5.459 | 6.13 | 4.788 |
| 809.53 | 5.592 | 6.332 | 4.851 |
| 810.02 | 5.666 | 6.46 | 4.871 |
| 810.51 | 5.734 | 6.591 | 4.878 |
| 811.0 | 5.767 | 6.682 | 4.851 |
| 811.48 | 5.772 | 6.763 | 4.781 |
| 811.96 | 5.766 | 6.826 | 4.705 |
| 812.56 | 5.712 | 6.859 | 4.566 |
| 813.04 | 5.626 | 6.828 | 4.425 |
| 813.52 | 5.522 | 6.786 | 4.259 |
| 814.0 | 5.41 | 6.741 | 4.08 |
| 814.47 | 5.261 | 6.643 | 3.878 |
| 815.06 | 5.061 | 6.499 | 3.623 |
| 815.53 | 4.877 | 6.373 | 3.381 |
| 816.0 | 4.683 | 6.202 | 3.164 |
| 816.46 | 4.484 | 6.039 | 2.928 |
| 817.05 | 4.222 | 5.803 | 2.641 |
| 817.51 | 3.992 | 5.585 | 2.398 |
| 817.97 | 3.784 | 5.387 | 2.18 |
| 818.54 | 3.52 | 5.122 | 1.917 |
| 819.0 | 3.308 | 4.918 | 1.698 |
| 819.45 | 3.1 | 4.685 | 1.515 |
| 820.02 | 2.864 | 4.421 | 1.307 |
| 820.47 | 2.681 | 4.207 | 1.155 |
| 821.03 | 2.48 | 3.966 | 0.993 |
| 821.47 | 2.317 | 3.759 | 0.876 |
| 822.03 | 2.144 | 3.534 | 0.753 |
| 822.47 | 2.02 | 3.354 | 0.686 |
| 823.02 | 1.906 | 3.185 | 0.628 |
| 823.45 | 1.831 | 3.067 | 0.596 |
| 824.0 | 1.754 | 2.902 | 0.606 |
| 824.54 | 1.723 | 2.811 | 0.634 |
| 824.97 | 1.698 | 2.719 | 0.677 |
| 825.5 | 1.704 | 2.665 | 0.742 |
| 826.03 | 1.715 | 2.6 | 0.83 |
| 826.46 | 1.761 | 2.602 | 0.92 |
| 826.99 | 1.806 | 2.575 | 1.038 |
| 827.51 | 1.895 | 2.611 | 1.179 |
| 828.03 | 2.01 | 2.663 | 1.357 |
| 828.55 | 2.122 | 2.726 | 1.519 |
| 828.97 | 2.213 | 2.785 | 1.642 |
| 829.48 | 2.343 | 2.879 | 1.808 |
| 830.0 | 2.489 | 2.987 | 1.991 |
| 830.51 | 2.629 | 3.1 | 2.158 |
| 831.01 | 2.787 | 3.247 | 2.327 |
| 831.52 | 2.933 | 3.389 | 2.476 |
| 832.02 | 3.083 | 3.531 | 2.635 |
| 832.53 | 3.229 | 3.694 | 2.764 |
| 833.03 | 3.37 | 3.849 | 2.891 |
| 833.52 | 3.493 | 4.005 | 2.981 |
| 834.02 | 3.593 | 4.135 | 3.051 |
| 834.52 | 3.713 | 4.298 | 3.128 |
| 835.01 | 3.813 | 4.458 | 3.168 |
| 835.5 | 3.878 | 4.553 | 3.203 |
| 835.99 | 3.943 | 4.693 | 3.193 |
| 836.48 | 3.991 | 4.809 | 3.174 |
| 836.97 | 4.04 | 4.931 | 3.149 |
| 837.46 | 4.049 | 5.01 | 3.087 |
| 838.04 | 4.05 | 5.121 | 2.98 |
| 838.53 | 4.031 | 5.181 | 2.881 |
| 839.01 | 4.003 | 5.237 | 2.77 |
| 839.5 | 3.955 | 5.27 | 2.64 |
| 839.98 | 3.906 | 5.318 | 2.494 |
| 840.46 | 3.829 | 5.326 | 2.333 |
| 841.04 | 3.763 | 5.388 | 2.138 |
| 841.53 | 3.68 | 5.389 | 1.972 |
| 842.01 | 3.602 | 5.379 | 1.824 |
| 842.49 | 3.501 | 5.358 | 1.643 |
| 842.98 | 3.415 | 5.351 | 1.479 |
| 843.46 | 3.324 | 5.333 | 1.314 |
| 844.04 | 3.232 | 5.304 | 1.161 |
| 844.53 | 3.144 | 5.259 | 1.029 |
| 845.02 | 3.059 | 5.2 | 0.918 |
| 845.5 | 2.997 | 5.178 | 0.816 |
| 845.99 | 2.944 | 5.128 | 0.759 |
| 846.48 | 2.911 | 5.112 | 0.71 |
| 846.97 | 2.874 | 5.077 | 0.671 |
| 847.46 | 2.853 | 5.034 | 0.672 |
| 847.96 | 2.829 | 4.965 | 0.694 |
| 848.55 | 2.845 | 4.929 | 0.76 |
| 849.05 | 2.867 | 4.872 | 0.862 |
| 849.55 | 2.91 | 4.852 | 0.968 |
| 850.05 | 2.977 | 4.833 | 1.12 |
| 850.55 | 3.036 | 4.794 | 1.279 |
| 850.96 | 3.095 | 4.752 | 1.439 |
| 851.46 | 3.192 | 4.726 | 1.658 |
| 851.97 | 3.283 | 4.681 | 1.884 |
| 852.48 | 3.393 | 4.655 | 2.131 |
| 852.99 | 3.501 | 4.607 | 2.394 |
| 853.51 | 3.627 | 4.572 | 2.682 |
| 854.03 | 3.751 | 4.539 | 2.962 |
| 854.55 | 3.889 | 4.521 | 3.257 |
| 854.97 | 3.966 | 4.454 | 3.478 |
| 855.49 | 4.099 | 4.431 | 3.767 |
| 856.02 | 4.222 | 4.38 | 4.064 |
| 856.55 | 4.334 | 4.33 | 4.339 |
| 856.98 | 4.419 | 4.295 | 4.544 |
| 857.51 | 4.53 | 4.257 | 4.802 |
| 858.05 | 4.62 | 4.21 | 5.031 |
| 858.48 | 4.688 | 4.168 | 5.208 |
| 859.03 | 4.744 | 4.102 | 5.387 |
| 859.46 | 4.796 | 4.076 | 5.517 |
| 860.01 | 4.842 | 4.027 | 5.657 |
| 860.45 | 4.867 | 3.994 | 5.741 |
| 861.01 | 4.898 | 3.959 | 5.837 |
| 861.45 | 4.911 | 3.952 | 5.869 |
| 862.01 | 4.885 | 3.886 | 5.884 |
| 862.46 | 4.878 | 3.887 | 5.869 |
| 863.02 | 4.835 | 3.862 | 5.809 |
| 863.48 | 4.801 | 3.868 | 5.734 |
| 864.05 | 4.733 | 3.869 | 5.597 |
| 864.51 | 4.667 | 3.859 | 5.474 |
| 864.97 | 4.602 | 3.881 | 5.323 |
| 865.54 | 4.514 | 3.924 | 5.105 |
| 866.01 | 4.429 | 3.945 | 4.914 |
| 866.47 | 4.349 | 3.991 | 4.708 |
| 867.06 | 4.242 | 4.064 | 4.421 |
| 867.53 | 4.114 | 4.074 | 4.155 |
| 868.0 | 4.039 | 4.166 | 3.912 |
| 868.47 | 3.939 | 4.21 | 3.667 |
| 868.95 | 3.836 | 4.282 | 3.389 |
| 869.54 | 3.719 | 4.387 | 3.051 |
| 870.02 | 3.606 | 4.43 | 2.783 |
| 870.5 | 3.531 | 4.522 | 2.54 |
| 870.98 | 3.452 | 4.61 | 2.293 |
| 871.47 | 3.359 | 4.671 | 2.046 |
| 871.95 | 3.307 | 4.78 | 1.834 |
| 872.56 | 3.231 | 4.851 | 1.61 |
| 873.05 | 3.17 | 4.918 | 1.422 |
| 873.54 | 3.119 | 4.94 | 1.299 |
| 874.03 | 3.094 | 5.028 | 1.16 |
| 874.52 | 3.061 | 5.053 | 1.069 |
| 875.01 | 3.048 | 5.082 | 1.015 |
| 875.5 | 3.023 | 5.078 | 0.967 |
| 876.0 | 3.037 | 5.078 | 0.996 |
| 876.5 | 3.045 | 5.06 | 1.03 |
| 876.99 | 3.06 | 5.024 | 1.096 |
| 877.49 | 3.083 | 4.978 | 1.189 |
| 877.99 | 3.127 | 4.937 | 1.317 |
| 878.49 | 3.16 | 4.827 | 1.493 |
| 878.99 | 3.209 | 4.749 | 1.669 |
| 879.49 | 3.274 | 4.665 | 1.883 |
| 880.0 | 3.337 | 4.559 | 2.115 |
| 880.5 | 3.401 | 4.44 | 2.363 |
| 881.0 | 3.484 | 4.331 | 2.638 |
| 881.51 | 3.554 | 4.194 | 2.914 |
| 882.01 | 3.655 | 4.099 | 3.21 |
| 882.52 | 3.729 | 3.936 | 3.523 |
| 883.02 | 3.816 | 3.807 | 3.824 |
| 883.53 | 3.894 | 3.683 | 4.105 |
| 884.03 | 3.989 | 3.583 | 4.394 |
| 884.54 | 4.107 | 3.522 | 4.691 |
| 885.04 | 4.184 | 3.409 | 4.96 |
| 885.55 | 4.275 | 3.342 | 5.207 |
| 886.06 | 4.373 | 3.297 | 5.45 |
| 886.56 | 4.458 | 3.256 | 5.66 |
| 886.94 | 4.545 | 3.275 | 5.816 |
| 887.45 | 4.649 | 3.307 | 5.99 |
| 887.95 | 4.691 | 3.298 | 6.085 |
| 888.46 | 4.796 | 3.389 | 6.204 |
| 888.97 | 4.864 | 3.474 | 6.254 |
| 889.47 | 4.94 | 3.593 | 6.287 |
| 889.97 | 5 | 3.713 | 6.287 |
| 890.48 | 5.052 | 3.852 | 6.251 |
| 890.98 | 5.095 | 4.03 | 6.161 |
| 891.48 | 5.107 | 4.171 | 6.042 |
| 891.99 | 5.149 | 4.392 | 5.907 |
| 892.49 | 5.135 | 4.572 | 5.698 |
| 892.99 | 5.137 | 4.778 | 5.497 |
| 893.49 | 5.087 | 4.938 | 5.237 |
| 893.99 | 5.039 | 5.096 | 4.982 |
| 894.48 | 4.961 | 5.241 | 4.682 |
| 894.98 | 4.887 | 5.374 | 4.401 |
| 895.48 | 4.757 | 5.452 | 4.063 |
| 895.97 | 4.639 | 5.517 | 3.761 |
| 896.46 | 4.482 | 5.543 | 3.422 |
| 896.96 | 4.324 | 5.556 | 3.093 |
| 897.45 | 4.14 | 5.498 | 2.781 |
| 898.06 | 3.895 | 5.386 | 2.403 |
| 898.55 | 3.717 | 5.279 | 2.155 |
| 899.03 | 3.52 | 5.131 | 1.909 |
| 899.52 | 3.337 | 4.977 | 1.697 |
| 900.0 | 3.173 | 4.822 | 1.524 |
| 900.48 | 3.026 | 4.657 | 1.396 |
| 900.96 | 2.962 | 4.597 | 1.328 |
| 901.56 | 2.914 | 4.551 | 1.277 |
| 902.04 | 2.96 | 4.598 | 1.322 |
| 902.51 | 3.063 | 4.726 | 1.401 |
| 902.99 | 3.288 | 5.012 | 1.563 |
| 903.46 | 3.626 | 5.469 | 1.782 |
| 904.05 | 4.186 | 6.232 | 2.141 |
| 904.51 | 4.768 | 7.058 | 2.479 |
| 904.98 | 5.457 | 8.053 | 2.861 |
| 905.45 | 6.27 | 9.239 | 3.3 |
| 906.02 | 7.469 | 11.03 | 3.909 |
| 906.48 | 8.581 | 12.687 | 4.475 |
| 907.06 | 10.074 | 14.963 | 5.185 |
| 907.51 | 11.364 | 16.931 | 5.796 |
| 907.97 | 12.778 | 19.097 | 6.459 |
| 908.53 | 14.629 | 21.994 | 7.264 |
| 908.98 | 16.221 | 24.482 | 7.961 |
| 909.54 | 18.318 | 27.812 | 8.824 |
| 909.99 | 19.975 | 30.453 | 9.498 |
| 910.54 | 22.126 | 33.878 | 10.374 |
| 910.98 | 23.903 | 36.736 | 11.07 |
| 911.53 | 26.105 | 40.303 | 11.908 |
| 911.97 | 27.908 | 43.229 | 12.587 |
| 912.51 | 30.046 | 46.745 | 13.347 |
| 913.05 | 32.198 | 50.272 | 14.124 |
| 913.48 | 33.848 | 53.022 | 14.674 |
| 914.02 | 35.874 | 56.392 | 15.357 |
| 914.55 | 37.764 | 59.531 | 15.998 |
| 914.97 | 39.232 | 62.004 | 16.461 |
| 915.5 | 40.952 | 64.902 | 17.001 |
| 916.02 | 42.55 | 67.632 | 17.469 |
| 916.54 | 44.112 | 70.332 | 17.892 |
| 916.96 | 45.192 | 72.207 | 18.177 |
| 917.48 | 46.47 | 74.455 | 18.484 |
| 917.99 | 47.609 | 76.51 | 18.709 |
| 918.5 | 48.67 | 78.451 | 18.889 |
| 919.01 | 49.565 | 80.143 | 18.987 |
| 919.52 | 50.323 | 81.658 | 18.988 |
| 920.02 | 51.062 | 83.166 | 18.957 |
| 920.53 | 51.635 | 84.426 | 18.844 |
| 921.03 | 52.102 | 85.541 | 18.663 |
| 921.53 | 52.535 | 86.648 | 18.422 |
| 922.02 | 52.862 | 87.624 | 18.099 |
| 922.52 | 53.077 | 88.448 | 17.705 |
| 923.01 | 53.285 | 89.321 | 17.25 |
| 923.5 | 53.373 | 90.012 | 16.734 |
| 923.99 | 53.44 | 90.697 | 16.184 |
| 924.48 | 53.39 | 91.232 | 15.549 |
| 924.96 | 53.32 | 91.772 | 14.869 |
| 925.55 | 53.146 | 92.275 | 14.017 |
| 926.03 | 53.023 | 92.783 | 13.263 |
| 926.51 | 52.828 | 93.173 | 12.483 |
| 927.0 | 52.633 | 93.595 | 11.672 |
| 927.48 | 52.37 | 93.861 | 10.878 |
| 927.96 | 52.14 | 94.212 | 10.068 |
| 928.53 | 51.785 | 94.455 | 9.115 |
| 929.01 | 51.528 | 94.688 | 8.369 |
| 929.49 | 51.301 | 94.969 | 7.633 |
| 929.97 | 51.058 | 95.146 | 6.97 |
| 930.55 | 50.832 | 95.392 | 6.273 |
| 931.03 | 50.676 | 95.575 | 5.778 |
| 931.5 | 50.547 | 95.719 | 5.376 |
| 931.98 | 50.477 | 95.861 | 5.093 |
| 932.46 | 50.487 | 96.03 | 4.944 |
| 933.04 | 50.548 | 96.18 | 4.916 |
| 933.52 | 50.65 | 96.252 | 5.048 |
| 934.0 | 50.834 | 96.342 | 5.326 |
| 934.49 | 51.129 | 96.485 | 5.772 |
| 934.97 | 51.487 | 96.575 | 6.399 |
| 935.55 | 51.964 | 96.618 | 7.311 |
| 936.04 | 52.484 | 96.733 | 8.235 |
| 936.53 | 53.077 | 96.8 | 9.355 |
| 937.01 | 53.756 | 96.919 | 10.593 |
| 937.51 | 54.454 | 96.953 | 11.955 |
| 938.0 | 55.234 | 96.993 | 13.474 |
| 938.49 | 56.104 | 97.116 | 15.092 |
| 938.99 | 56.971 | 97.15 | 16.791 |
| 939.48 | 57.89 | 97.19 | 18.59 |
| 939.98 | 58.885 | 97.3 | 20.469 |
| 940.49 | 59.897 | 97.37 | 22.423 |
| 940.99 | 60.894 | 97.434 | 24.355 |
| 941.5 | 61.916 | 97.512 | 26.319 |
| 942.01 | 62.924 | 97.553 | 28.294 |
| 942.52 | 63.946 | 97.593 | 30.299 |
| 943.03 | 64.963 | 97.659 | 32.267 |
| 943.55 | 65.933 | 97.691 | 34.174 |
| 943.96 | 66.723 | 97.714 | 35.732 |
| 944.48 | 67.72 | 97.833 | 37.608 |
| 945.0 | 68.692 | 97.898 | 39.486 |
| 945.53 | 69.605 | 97.968 | 41.241 |
| 945.95 | 70.288 | 97.965 | 42.611 |
| 946.48 | 71.182 | 98.085 | 44.278 |
| 947.02 | 72.031 | 98.125 | 45.938 |
| 947.55 | 72.881 | 98.238 | 47.525 |
| 947.98 | 73.469 | 98.224 | 48.713 |
| 948.53 | 74.244 | 98.313 | 50.174 |
| 948.96 | 74.848 | 98.353 | 51.343 |
| 949.51 | 75.583 | 98.467 | 52.698 |
| 949.95 | 76.168 | 98.539 | 53.796 |
| 950.5 | 76.874 | 98.618 | 55.13 |
| 950.95 | 77.368 | 98.594 | 56.142 |
| 951.5 | 78.031 | 98.656 | 57.406 |
| 951.95 | 78.578 | 98.765 | 58.392 |
| 952.51 | 79.18 | 98.784 | 59.576 |
| 952.97 | 79.703 | 98.908 | 60.498 |
| 953.53 | 80.276 | 98.919 | 61.634 |
| 953.99 | 80.769 | 99.002 | 62.536 |
| 954.45 | 81.228 | 99.025 | 63.432 |
| 955.03 | 81.806 | 99.068 | 64.544 |
| 955.49 | 82.256 | 99.094 | 65.418 |
| 955.95 | 82.766 | 99.195 | 66.337 |
| 956.53 | 83.322 | 99.212 | 67.432 |
| 957.0 | 83.789 | 99.28 | 68.299 |
| 957.47 | 84.221 | 99.258 | 69.184 |
| 958.06 | 84.81 | 99.32 | 70.299 |
| 958.54 | 85.274 | 99.376 | 71.172 |
| 959.01 | 85.72 | 99.335 | 72.105 |
| 959.49 | 86.178 | 99.361 | 72.995 |
| 959.97 | 86.623 | 99.361 | 73.885 |
| 960.45 | 87.123 | 99.462 | 74.784 |
| 961.05 | 87.635 | 99.405 | 75.866 |
| 961.53 | 88.117 | 99.479 | 76.754 |
| 962.02 | 88.558 | 99.46 | 77.656 |
| 962.5 | 89.03 | 99.506 | 78.554 |
| 962.99 | 89.444 | 99.498 | 79.391 |
| 963.48 | 89.908 | 99.568 | 80.248 |
| 963.97 | 90.293 | 99.494 | 81.093 |
| 964.46 | 90.739 | 99.542 | 81.936 |
| 964.95 | 91.122 | 99.509 | 82.735 |
| 965.56 | 91.655 | 99.571 | 83.738 |
| 966.06 | 92.021 | 99.55 | 84.492 |
| 966.55 | 92.426 | 99.646 | 85.206 |
| 967.05 | 92.782 | 99.629 | 85.935 |
| 967.55 | 93.113 | 99.611 | 86.615 |
| 968.04 | 93.504 | 99.698 | 87.31 |
| 968.54 | 93.794 | 99.663 | 87.925 |
| 969.04 | 94.095 | 99.649 | 88.541 |
| 969.54 | 94.424 | 99.728 | 89.12 |
| 970.04 | 94.697 | 99.707 | 89.686 |
| 970.54 | 94.933 | 99.63 | 90.235 |
| 971.04 | 95.207 | 99.695 | 90.72 |
| 971.54 | 95.48 | 99.763 | 91.197 |
| 972.05 | 95.674 | 99.742 | 91.606 |
| 972.55 | 95.884 | 99.69 | 92.077 |
| 973.05 | 96.084 | 99.711 | 92.457 |
| 973.55 | 96.296 | 99.725 | 92.866 |
| 974.05 | 96.469 | 99.711 | 93.227 |
| 974.56 | 96.675 | 99.769 | 93.582 |
| 975.06 | 96.816 | 99.722 | 93.911 |
| 975.56 | 96.99 | 99.77 | 94.21 |
| 976.06 | 97.083 | 99.692 | 94.473 |
| 976.44 | 97.208 | 99.716 | 94.7 |
| 976.94 | 97.353 | 99.733 | 94.974 |
| 977.44 | 97.472 | 99.759 | 95.185 |
| 977.95 | 97.583 | 99.787 | 95.378 |
| 978.45 | 97.704 | 99.749 | 95.658 |
| 978.95 | 97.779 | 99.774 | 95.784 |
| 979.45 | 97.926 | 99.843 | 96.009 |
| 979.95 | 97.978 | 99.786 | 96.171 |
| 980.44 | 98.062 | 99.754 | 96.369 |
| 980.94 | 98.147 | 99.779 | 96.515 |
| 981.56 | 98.232 | 99.793 | 96.671 |
| 982.06 | 98.285 | 99.774 | 96.797 |
| 982.55 | 98.337 | 99.777 | 96.896 |
| 983.05 | 98.42 | 99.824 | 97.017 |
| 983.54 | 98.459 | 99.826 | 97.093 |
| 984.03 | 98.529 | 99.803 | 97.255 |
| 984.52 | 98.579 | 99.82 | 97.339 |
| 985.01 | 98.627 | 99.832 | 97.423 |
| 985.5 | 98.649 | 99.776 | 97.521 |
| 985.99 | 98.687 | 99.803 | 97.572 |
| 986.48 | 98.707 | 99.78 | 97.635 |
| 986.96 | 98.789 | 99.853 | 97.726 |
| 987.56 | 98.81 | 99.847 | 97.774 |
| 988.05 | 98.814 | 99.765 | 97.863 |
| 988.53 | 98.921 | 99.899 | 97.943 |
| 989.0 | 98.887 | 99.815 | 97.959 |
| 989.48 | 98.926 | 99.838 | 98.014 |
| 990.01 | 99.039 | 99.929 | 98.148 |
| 990.51 | 99.061 | 99.927 | 98.196 |
| 991.02 | 99.09 | 99.951 | 98.229 |
| 991.52 | 99.098 | 99.923 | 98.272 |
| 992.03 | 99.106 | 99.931 | 98.281 |
| 992.53 | 99.118 | 99.922 | 98.313 |
| 993.03 | 99.134 | 99.92 | 98.349 |
| 993.53 | 99.144 | 99.911 | 98.378 |
| 994.04 | 99.175 | 99.928 | 98.421 |
| 994.54 | 99.195 | 99.932 | 98.459 |
| 995.04 | 99.192 | 99.933 | 98.451 |
| 995.54 | 99.205 | 99.935 | 98.476 |
| 996.04 | 99.22 | 99.935 | 98.504 |
| 996.53 | 99.225 | 99.951 | 98.5 |
| 997.03 | 99.226 | 99.926 | 98.526 |
| 997.53 | 99.267 | 99.959 | 98.576 |
| 998.02 | 99.257 | 99.927 | 98.588 |
| 998.52 | 99.249 | 99.935 | 98.563 |
| 999.01 | 99.277 | 99.945 | 98.61 |
| 999.51 | 99.259 | 99.947 | 98.572 |
| 1000.0 | 99.284 | 99.958 | 98.61 |
| 1000.49 | 99.28 | 99.927 | 98.633 |
| 1000.98 | 99.287 | 99.957 | 98.617 |
| 1001.47 | 99.309 | 99.952 | 98.666 |
| 1001.96 | 99.287 | 99.937 | 98.636 |
| 1002.45 | 99.306 | 99.946 | 98.666 |
| 1002.94 | 99.322 | 99.968 | 98.675 |
| 1003.43 | 99.31 | 99.945 | 98.675 |
| 1003.92 | 99.304 | 99.94 | 98.667 |
| 1004.4 | 99.311 | 99.948 | 98.673 |
| 1004.89 | 99.306 | 99.941 | 98.671 |
| 1005.61 | 99.34 | 99.958 | 98.723 |
| 1006.09 | 99.352 | 99.996 | 98.709 |
| 1006.58 | 99.337 | 99.942 | 98.733 |
| 1007.06 | 99.366 | 99.993 | 98.74 |
| 1007.54 | 99.361 | 99.96 | 98.762 |
| 1008.02 | 99.375 | 99.983 | 98.767 |
| 1008.5 | 99.371 | 99.967 | 98.775 |
| 1008.97 | 99.397 | 99.991 | 98.804 |
| 1009.45 | 99.391 | 99.978 | 98.804 |
| 1009.92 | 99.379 | 99.963 | 98.796 |
| 1010.4 | 99.394 | 99.965 | 98.824 |
| 1011.11 | 99.421 | 100 | 98.843 |
| 1011.58 | 99.441 | 99.996 | 98.886 |
| 1012.05 | 99.462 | 100.041 | 98.883 |
| 1012.52 | 99.463 | 100.012 | 98.915 |
| 1012.99 | 99.46 | 99.997 | 98.924 |
| 1013.46 | 99.471 | 100 | 98.942 |
| 1013.93 | 99.476 | 100.012 | 98.939 |
| 1014.4 | 99.478 | 99.999 | 98.957 |
| 1015.09 | 99.492 | 99.983 | 99.001 |
| 1015.56 | 99.496 | 99.984 | 99.008 |
| 1016.02 | 99.517 | 99.985 | 99.05 |
| 1016.48 | 99.525 | 100.014 | 99.036 |
| 1016.95 | 99.547 | 100.017 | 99.077 |
| 1017.41 | 99.529 | 99.99 | 99.068 |
| 1018.1 | 99.563 | 99.997 | 99.129 |
| 1018.55 | 99.588 | 100.011 | 99.166 |
| 1019.01 | 99.575 | 99.988 | 99.162 |
| 1019.47 | 99.6 | 100.015 | 99.184 |
| 1019.92 | 99.607 | 99.996 | 99.218 |
| 1020.6 | 99.611 | 99.994 | 99.227 |
| 1021.06 | 99.634 | 100.02 | 99.247 |
| 1021.51 | 99.635 | 99.977 | 99.293 |
| 1021.96 | 99.674 | 100.039 | 99.309 |
| 1022.41 | 99.663 | 100.021 | 99.304 |
| 1023.08 | 99.679 | 100.024 | 99.333 |
| 1023.53 | 99.694 | 100.005 | 99.383 |
| 1023.98 | 99.688 | 99.998 | 99.379 |
| 1024.42 | 99.7 | 100.005 | 99.396 |
| 1025.09 | 99.717 | 100.011 | 99.422 |
| 1025.53 | 99.729 | 100.018 | 99.441 |
| 1025.97 | 99.742 | 100.017 | 99.468 |
| 1026.42 | 99.75 | 100.029 | 99.471 |
| 1027.08 | 99.761 | 100.036 | 99.485 |
| 1027.52 | 99.773 | 100.024 | 99.521 |
| 1027.95 | 99.778 | 100.012 | 99.543 |
| 1028.61 | 99.784 | 100.025 | 99.544 |
| 1029.04 | 99.772 | 100.014 | 99.53 |
| 1029.48 | 99.8 | 100.023 | 99.577 |
| 1029.91 | 99.8 | 100.011 | 99.589 |
| 1030.56 | 99.812 | 100.006 | 99.618 |
| 1031.0 | 99.82 | 100.02 | 99.62 |
| 1031.43 | 99.841 | 100.032 | 99.651 |
| 1032.07 | 99.833 | 100.015 | 99.651 |
| 1032.5 | 99.83 | 99.975 | 99.685 |
| 1032.93 | 99.855 | 100.033 | 99.677 |
| 1033.57 | 99.846 | 100.026 | 99.667 |
| 1033.99 | 99.854 | 100.015 | 99.694 |
| 1034.42 | 99.866 | 100.026 | 99.706 |
| 1035.06 | 99.871 | 100.014 | 99.728 |
| 1035.48 | 99.871 | 100.026 | 99.715 |
| 1035.9 | 99.872 | 100.016 | 99.727 |
| 1036.53 | 99.882 | 100.03 | 99.734 |
| 1036.95 | 99.884 | 100.011 | 99.756 |
| 1037.58 | 99.898 | 100.036 | 99.759 |
| 1038.0 | 99.886 | 100.012 | 99.759 |
| 1038.42 | 99.903 | 100.037 | 99.77 |
| 1039.04 | 99.894 | 100.015 | 99.773 |
| 1039.46 | 99.906 | 100.018 | 99.793 |
| 1040.08 | 99.89 | 99.999 | 99.782 |
| 1040.49 | 99.918 | 100.026 | 99.81 |
| 1040.91 | 99.909 | 100.027 | 99.79 |
| 1041.53 | 99.911 | 100.012 | 99.81 |
| 1041.94 | 99.911 | 100.017 | 99.805 |
| 1042.55 | 99.922 | 100.041 | 99.804 |
| 1042.96 | 99.93 | 100.036 | 99.824 |
| 1043.58 | 99.925 | 100.028 | 99.823 |
| 1043.99 | 99.92 | 100.024 | 99.816 |
| 1044.6 | 99.916 | 99.993 | 99.839 |
| 1045.01 | 99.926 | 100.005 | 99.846 |
| 1045.41 | 99.923 | 100.031 | 99.815 |
| 1046.02 | 99.919 | 100.02 | 99.818 |
| 1046.43 | 99.936 | 100.012 | 99.86 |
| 1047.03 | 99.925 | 100.016 | 99.834 |
| 1047.44 | 99.925 | 100.005 | 99.845 |
| 1048.04 | 99.921 | 99.99 | 99.853 |
| 1048.44 | 99.912 | 99.983 | 99.841 |
| 1049.05 | 99.916 | 100.002 | 99.829 |
| 1049.45 | 99.923 | 99.995 | 99.852 |
| 1050.05 | 99.918 | 100.001 | 99.835 |
| 1050.45 | 99.91 | 99.995 | 99.824 |
| 1051.05 | 99.903 | 99.984 | 99.822 |
| 1051.45 | 99.932 | 100.02 | 99.844 |
| 1052.05 | 99.926 | 100.01 | 99.842 |
| 1052.45 | 99.92 | 100.008 | 99.832 |
| 1053.04 | 99.903 | 99.987 | 99.82 |
| 1053.44 | 99.924 | 99.996 | 99.852 |
| 1054.04 | 99.927 | 100.013 | 99.842 |
| 1054.44 | 99.909 | 100.007 | 99.811 |
| 1055.03 | 99.915 | 100 | 99.829 |
| 1055.43 | 99.907 | 100.009 | 99.806 |
| 1056.02 | 99.904 | 99.996 | 99.812 |
| 1056.42 | 99.886 | 99.988 | 99.785 |
| 1057.01 | 99.893 | 100.017 | 99.768 |
| 1057.41 | 99.898 | 100.001 | 99.796 |
| 1058.0 | 99.893 | 99.992 | 99.794 |
| 1058.6 | 99.743 | 99.994 | 99.493 |
| 1058.99 | 99.887 | 100.007 | 99.767 |
| 1059.58 | 99.882 | 100.003 | 99.761 |
| 1059.98 | 99.874 | 99.995 | 99.753 |
| 1060.57 | 99.867 | 99.98 | 99.753 |
| 1060.97 | 99.88 | 100.028 | 99.731 |
| 1061.56 | 99.869 | 100.028 | 99.711 |
| 1061.95 | 99.856 | 100.01 | 99.702 |
| 1062.55 | 99.868 | 100.024 | 99.712 |
| 1062.94 | 99.849 | 100.007 | 99.691 |
| 1063.54 | 99.855 | 99.998 | 99.713 |
| 1063.93 | 99.843 | 100.013 | 99.672 |
| 1064.52 | 99.847 | 100.022 | 99.672 |
| 1064.92 | 99.824 | 100.007 | 99.642 |
| 1065.51 | 99.829 | 100.028 | 99.629 |
| 1065.91 | 99.823 | 100.031 | 99.614 |
| 1066.5 | 99.817 | 100.038 | 99.596 |
| 1067.1 | 99.797 | 100.01 | 99.584 |
| 1067.5 | 99.807 | 100.034 | 99.58 |
| 1068.09 | 99.78 | 100.024 | 99.536 |
| 1068.49 | 99.793 | 100.039 | 99.547 |
| 1069.09 | 99.804 | 100.062 | 99.546 |
| 1069.49 | 99.776 | 100.049 | 99.504 |
| 1070.08 | 99.767 | 100.027 | 99.507 |
| 1070.48 | 99.765 | 100.043 | 99.487 |
| 1071.08 | 99.759 | 100.038 | 99.48 |
| 1071.48 | 99.773 | 100.053 | 99.494 |
| 1072.08 | 99.766 | 100.065 | 99.468 |
| 1072.49 | 99.739 | 100.037 | 99.44 |
| 1073.09 | 99.759 | 100.051 | 99.466 |
| 1073.49 | 99.734 | 100.026 | 99.442 |
| 1074.09 | 99.756 | 100.072 | 99.441 |
| 1074.5 | 99.752 | 100.075 | 99.43 |
| 1075.1 | 99.738 | 100.037 | 99.439 |
| 1075.51 | 99.743 | 100.049 | 99.438 |
| 1075.91 | 99.75 | 100.042 | 99.458 |
| 1076.52 | 99.747 | 100.051 | 99.443 |
| 1076.93 | 99.743 | 100.021 | 99.465 |
| 1077.54 | 99.733 | 100.018 | 99.447 |
| 1077.95 | 99.749 | 100.037 | 99.461 |
| 1078.56 | 99.754 | 100.024 | 99.484 |
| 1078.97 | 99.768 | 100.056 | 99.481 |
| 1079.59 | 99.794 | 100.063 | 99.525 |
| 1080.0 | 99.767 | 100.024 | 99.51 |
| 1080.41 | 99.776 | 100.054 | 99.499 |
| 1081.03 | 99.789 | 100.043 | 99.534 |
| 1081.44 | 99.793 | 100.039 | 99.547 |
| 1082.06 | 99.82 | 100.05 | 99.589 |
| 1082.48 | 99.811 | 100.03 | 99.593 |
| 1083.1 | 99.805 | 100.032 | 99.577 |
| 1083.52 | 99.815 | 100.012 | 99.617 |
| 1083.94 | 99.835 | 100.038 | 99.633 |
| 1084.56 | 99.851 | 100.05 | 99.651 |
| 1084.98 | 99.872 | 100.042 | 99.701 |
| 1085.4 | 99.869 | 100.037 | 99.701 |
| 1086.03 | 99.876 | 100.022 | 99.73 |
| 1086.46 | 99.865 | 100.017 | 99.713 |
| 1087.09 | 99.887 | 100.014 | 99.759 |
| 1087.52 | 99.903 | 100.037 | 99.769 |
| 1087.94 | 99.901 | 100.029 | 99.773 |
| 1088.58 | 99.898 | 100 | 99.795 |
| 1089.01 | 99.929 | 100.043 | 99.815 |
| 1089.44 | 99.921 | 100.036 | 99.805 |
| 1090.08 | 99.924 | 99.998 | 99.85 |
| 1090.51 | 99.931 | 100.028 | 99.833 |
| 1090.94 | 99.943 | 100.024 | 99.863 |
| 1091.59 | 99.952 | 100.04 | 99.864 |
| 1092.02 | 99.952 | 100.021 | 99.883 |
| 1092.46 | 99.953 | 100.01 | 99.895 |
| 1093.11 | 99.952 | 100.032 | 99.872 |
| 1093.54 | 99.954 | 100.008 | 99.9 |
| 1093.98 | 99.96 | 100.015 | 99.905 |
| 1094.42 | 99.986 | 100.051 | 99.921 |
| 1095.08 | 99.984 | 100.033 | 99.935 |
| 1095.52 | 99.986 | 100.026 | 99.946 |
| 1095.96 | 99.985 | 100.03 | 99.94 |
| 1096.4 | 99.985 | 100.018 | 99.952 |
| 1097.07 | 99.99 | 100.027 | 99.953 |
| 1097.51 | 99.982 | 100.005 | 99.958 |
| 1097.96 | 99.999 | 100.033 | 99.964 |
| 1098.41 | 100.006 | 100.045 | 99.966 |
| 1099.08 | 99.984 | 100.008 | 99.96 |
| 1099.53 | 99.997 | 100.03 | 99.964 |
| 1099.98 | 99.999 | 100.019 | 99.978 |
| 1100.43 | 99.991 | 100 | 99.981 |
| 1101.1 | 99.986 | 100.003 | 99.969 |
| 1101.56 | 99.993 | 100.007 | 99.979 |
| 1102.01 | 99.986 | 99.997 | 99.974 |
| 1102.47 | 100.018 | 100.024 | 100.011 |
| 1102.92 | 100.025 | 100.05 | 100 |
| 1103.61 | 100.007 | 100.02 | 99.994 |
| 1104.07 | 100.017 | 100.025 | 100.009 |
| 1104.53 | 100.005 | 100.006 | 100.005 |
| 1104.99 | 100.019 | 100.035 | 100.003 |
| 1105.45 | 100.004 | 99.993 | 100.015 |
| 1105.91 | 100.035 | 100.031 | 100.038 |
| 1106.61 | 100.014 | 100.027 | 100 |
| 1107.07 | 100.026 | 100.042 | 100.011 |
| 1107.54 | 100.021 | 100.034 | 100.008 |
| 1108.0 | 100.025 | 100.026 | 100.023 |
| 1108.47 | 100 | 99.999 | 100.001 |
| 1108.94 | 100.016 | 100.016 | 100.016 |
| 1109.41 | 100.027 | 100.027 | 100.027 |
| 1110.11 | 100.028 | 100.024 | 100.031 |
| 1110.58 | 100.004 | 99.996 | 100.012 |
| 1111.06 | 100.025 | 100.016 | 100.033 |
| 1111.53 | 100.027 | 100.028 | 100.025 |
| 1112.0 | 100.011 | 99.998 | 100.024 |
| 1112.48 | 100.003 | 99.977 | 100.028 |
| 1112.96 | 100.019 | 100.009 | 100.03 |
| 1113.43 | 100.014 | 100.018 | 100.009 |
| 1113.91 | 100.027 | 100.034 | 100.019 |
| 1114.39 | 100.028 | 100.021 | 100.035 |
| 1115.11 | 100.025 | 100.013 | 100.038 |
| 1115.59 | 100.028 | 100.033 | 100.022 |
| 1116.07 | 100.024 | 100.01 | 100.038 |
| 1116.56 | 100.028 | 100.036 | 100.02 |
| 1117.04 | 100.003 | 99.998 | 100.008 |
| 1117.52 | 100.022 | 99.999 | 100.045 |
| 1118.01 | 100.019 | 100.007 | 100.03 |
| 1118.49 | 99.993 | 99.976 | 100.01 |
| 1118.98 | 100.023 | 99.995 | 100.05 |
| 1119.47 | 100.013 | 100.013 | 100.014 |
| 1119.96 | 100.019 | 100.028 | 100.01 |
| 1120.45 | 100.008 | 100.005 | 100.011 |
| 1120.94 | 100.021 | 100.01 | 100.033 |
| 1121.43 | 100.032 | 100.024 | 100.039 |
| 1121.92 | 100.017 | 100.006 | 100.028 |
| 1122.41 | 100.012 | 100.014 | 100.01 |
| 1122.91 | 100.02 | 100.005 | 100.035 |
| 1123.4 | 100.024 | 100.017 | 100.03 |
| 1123.89 | 100.01 | 100.009 | 100.011 |
| 1124.39 | 100.006 | 99.992 | 100.02 |
| 1124.89 | 100.013 | 99.996 | 100.031 |
| 1125.38 | 100.007 | 99.999 | 100.015 |
| 1125.88 | 100.028 | 100.029 | 100.027 |
| 1126.38 | 99.991 | 99.984 | 99.998 |
| 1126.88 | 100.002 | 99.999 | 100.005 |
| 1127.38 | 99.991 | 99.974 | 100.009 |
| 1127.88 | 100.014 | 100.011 | 100.018 |
| 1128.38 | 100.007 | 100.001 | 100.014 |
| 1128.88 | 100.021 | 100.018 | 100.025 |
| 1129.38 | 99.993 | 99.995 | 99.991 |
| 1129.88 | 100.007 | 100.001 | 100.013 |
| 1130.39 | 100.006 | 100.02 | 99.992 |
| 1130.89 | 100.004 | 100.002 | 100.006 |
| 1131.4 | 99.995 | 99.999 | 99.992 |
| 1131.9 | 99.986 | 99.987 | 99.985 |
| 1132.41 | 99.995 | 99.994 | 99.996 |
| 1132.91 | 100.004 | 100.004 | 100.004 |
| 1133.42 | 100.001 | 100.013 | 99.989 |
| 1133.93 | 99.992 | 99.998 | 99.986 |
| 1134.43 | 99.988 | 99.989 | 99.987 |
| 1134.94 | 99.994 | 100.003 | 99.986 |
| 1135.45 | 99.995 | 100.01 | 99.98 |
| 1135.96 | 100.002 | 100.013 | 99.99 |
| 1136.47 | 100.001 | 100.014 | 99.988 |
| 1136.98 | 99.988 | 100.006 | 99.969 |
| 1137.49 | 99.993 | 100.024 | 99.962 |
| 1138.0 | 99.992 | 100.019 | 99.964 |
| 1138.51 | 100.006 | 100.041 | 99.971 |
| 1139.02 | 99.998 | 100.041 | 99.954 |
| 1139.53 | 99.989 | 100.013 | 99.966 |
| 1140.05 | 99.998 | 100.004 | 99.991 |
| 1140.56 | 99.993 | 100.021 | 99.965 |
| 1141.07 | 99.982 | 100.017 | 99.947 |
| 1141.58 | 99.978 | 100.013 | 99.944 |
| 1142.1 | 99.974 | 100.018 | 99.931 |
| 1142.61 | 99.971 | 100.014 | 99.929 |
| 1143.13 | 99.968 | 100.019 | 99.917 |
| 1143.38 | 99.98 | 100.029 | 99.93 |
| 1143.9 | 99.956 | 100.022 | 99.891 |
| 1144.41 | 99.955 | 100.011 | 99.898 |
| 1144.93 | 99.967 | 100.013 | 99.921 |
| 1145.44 | 99.981 | 100.031 | 99.932 |
| 1145.96 | 99.959 | 100.014 | 99.904 |
| 1146.47 | 99.964 | 100.021 | 99.907 |
| 1146.99 | 99.957 | 100.016 | 99.897 |
| 1147.5 | 99.949 | 100.003 | 99.895 |
| 1148.02 | 99.942 | 100.011 | 99.874 |
| 1148.54 | 99.946 | 100.013 | 99.879 |
| 1149.05 | 99.933 | 99.996 | 99.87 |
| 1149.57 | 99.957 | 100.015 | 99.898 |
| 1150.08 | 99.946 | 100.036 | 99.855 |
| 1150.6 | 99.936 | 100.031 | 99.842 |
| 1151.12 | 99.931 | 100.033 | 99.829 |
| 1151.63 | 99.948 | 100.03 | 99.866 |
| 1151.89 | 99.926 | 100.02 | 99.833 |
| 1152.41 | 99.93 | 100.028 | 99.833 |
| 1152.92 | 99.94 | 100.022 | 99.857 |
| 1153.44 | 99.914 | 99.996 | 99.832 |
| 1153.96 | 99.925 | 100.037 | 99.813 |
| 1154.47 | 99.907 | 99.985 | 99.829 |
| 1154.99 | 99.916 | 100.013 | 99.819 |
| 1155.5 | 99.918 | 100.029 | 99.806 |
| 1156.02 | 99.919 | 100.023 | 99.816 |
| 1156.54 | 99.916 | 100.032 | 99.8 |
| 1157.05 | 99.899 | 100.019 | 99.779 |
| 1157.57 | 99.906 | 100.022 | 99.789 |
| 1158.08 | 99.914 | 100.028 | 99.8 |
| 1158.6 | 99.91 | 100.034 | 99.785 |
| 1159.11 | 99.901 | 100.01 | 99.792 |
| 1159.63 | 99.903 | 100.043 | 99.762 |
| 1159.88 | 99.913 | 100.037 | 99.789 |
| 1160.4 | 99.904 | 99.999 | 99.809 |
| 1160.91 | 99.894 | 100.02 | 99.767 |
| 1161.43 | 99.898 | 100.019 | 99.776 |
| 1161.94 | 99.895 | 100.023 | 99.767 |
| 1162.45 | 99.904 | 100.033 | 99.775 |
| 1162.97 | 99.908 | 100.036 | 99.78 |
| 1163.48 | 99.893 | 100.024 | 99.761 |
| 1163.99 | 99.898 | 100.019 | 99.777 |
| 1164.5 | 99.907 | 100.05 | 99.764 |
| 1165.01 | 99.9 | 100.035 | 99.766 |
| 1165.53 | 99.909 | 100.031 | 99.786 |
| 1166.04 | 99.91 | 100.051 | 99.769 |
| 1166.55 | 99.887 | 100.022 | 99.752 |
| 1167.06 | 99.895 | 100.048 | 99.742 |
| 1167.57 | 99.9 | 100.049 | 99.751 |
| 1168.08 | 99.906 | 100.044 | 99.768 |
| 1168.58 | 99.905 | 100.043 | 99.767 |
| 1169.09 | 99.908 | 100.041 | 99.775 |
| 1169.6 | 99.909 | 100.046 | 99.773 |
| 1170.11 | 99.912 | 100.049 | 99.776 |
| 1170.61 | 99.901 | 100.027 | 99.776 |
| 1171.12 | 99.888 | 100.005 | 99.77 |
| 1171.63 | 99.914 | 100.038 | 99.79 |
| 1171.88 | 99.907 | 100.044 | 99.77 |
| 1172.38 | 99.914 | 100.047 | 99.781 |
| 1172.89 | 99.91 | 100.033 | 99.787 |
| 1173.39 | 99.918 | 100.047 | 99.789 |
| 1173.89 | 99.911 | 100.033 | 99.788 |
| 1174.4 | 99.907 | 100.022 | 99.791 |
| 1174.9 | 99.895 | 100.006 | 99.784 |
| 1175.4 | 99.908 | 100.027 | 99.789 |
| 1175.9 | 99.906 | 100.026 | 99.785 |
| 1176.4 | 99.901 | 100.017 | 99.785 |
| 1176.9 | 99.914 | 100.025 | 99.803 |
| 1177.4 | 99.912 | 100.027 | 99.797 |
| 1177.9 | 99.899 | 100.018 | 99.781 |
| 1178.39 | 99.908 | 100.033 | 99.784 |
| 1178.89 | 99.912 | 100.007 | 99.817 |
| 1179.39 | 99.919 | 100.051 | 99.787 |
| 1179.88 | 99.899 | 100.013 | 99.784 |
| 1180.62 | 99.915 | 100.059 | 99.771 |
| 1181.12 | 99.923 | 100.058 | 99.789 |
| 1181.61 | 99.92 | 100.06 | 99.78 |
| 1182.1 | 99.983 | 100.147 | 99.819 |
| 1182.59 | 99.909 | 100.066 | 99.752 |
| 1183.08 | 99.913 | 100.06 | 99.766 |
| 1183.57 | 99.937 | 100.061 | 99.814 |
| 1184.06 | 99.93 | 100.051 | 99.809 |
| 1184.55 | 99.895 | 100.029 | 99.76 |
| 1185.03 | 99.915 | 100.045 | 99.786 |
| 1185.52 | 99.917 | 100.055 | 99.778 |
| 1186.01 | 99.906 | 100.057 | 99.755 |
| 1186.49 | 99.916 | 100.048 | 99.784 |
| 1186.97 | 99.927 | 100.058 | 99.797 |
| 1187.46 | 99.933 | 100.06 | 99.806 |
| 1187.94 | 99.918 | 100.054 | 99.782 |
| 1188.42 | 99.897 | 100.041 | 99.754 |
| 1188.9 | 99.918 | 100.058 | 99.778 |
| 1189.62 | 99.91 | 100.045 | 99.776 |
| 1190.1 | 99.909 | 100.052 | 99.765 |
| 1190.57 | 99.898 | 100.021 | 99.776 |
| 1191.05 | 99.909 | 100.038 | 99.779 |
| 1191.53 | 99.901 | 100.038 | 99.764 |
| 1192.0 | 99.924 | 100.065 | 99.782 |
| 1192.47 | 99.883 | 100.024 | 99.742 |
| 1192.95 | 99.908 | 100.072 | 99.744 |
| 1193.42 | 99.911 | 100.042 | 99.78 |
| 1193.89 | 99.905 | 100.079 | 99.731 |
| 1194.59 | 99.897 | 100.057 | 99.736 |
| 1195.06 | 99.894 | 100.072 | 99.716 |
| 1195.53 | 99.872 | 100.032 | 99.711 |
| 1195.99 | 99.853 | 100.026 | 99.681 |
| 1196.46 | 99.882 | 100.048 | 99.716 |
| 1196.92 | 99.869 | 100.024 | 99.713 |
| 1197.39 | 99.856 | 100.032 | 99.68 |
| 1198.08 | 99.875 | 100.041 | 99.71 |
| 1198.54 | 99.871 | 100.041 | 99.701 |
| 1199.0 | 99.85 | 100.022 | 99.677 |
| 1199.46 | 99.857 | 100.034 | 99.68 |
| 1199.92 | 99.866 | 100.056 | 99.675 |
| 1200.61 | 99.865 | 100.069 | 99.661 |
| 1201.06 | 99.842 | 100.053 | 99.631 |
| 1201.52 | 99.846 | 100.097 | 99.595 |
| 1201.97 | 99.825 | 100.032 | 99.618 |
| 1202.42 | 99.833 | 100.044 | 99.623 |
| 1203.1 | 99.82 | 100.084 | 99.557 |
| 1203.55 | 99.8 | 100.042 | 99.558 |
| 1204.0 | 99.799 | 100.052 | 99.546 |
| 1204.45 | 99.794 | 100.022 | 99.565 |
| 1204.9 | 99.801 | 100.064 | 99.538 |
| 1205.57 | 99.772 | 100.042 | 99.502 |
| 1206.01 | 99.776 | 100.055 | 99.498 |
| 1206.46 | 99.755 | 100.028 | 99.481 |
| 1206.9 | 99.741 | 100.032 | 99.45 |
| 1207.57 | 99.73 | 100.036 | 99.424 |
| 1208.01 | 99.734 | 100.022 | 99.446 |
| 1208.45 | 99.73 | 100.057 | 99.404 |
| 1209.11 | 99.715 | 100.047 | 99.383 |
| 1209.54 | 99.715 | 100.077 | 99.353 |
| 1209.98 | 99.689 | 100.065 | 99.312 |
| 1210.42 | 99.693 | 100.077 | 99.31 |
| 1211.07 | 99.657 | 100.073 | 99.241 |
| 1211.5 | 99.643 | 100.08 | 99.207 |
| 1211.94 | 99.63 | 100.037 | 99.222 |
| 1212.58 | 99.608 | 100.045 | 99.171 |
| 1213.01 | 99.6 | 100.051 | 99.149 |
| 1213.44 | 99.593 | 100.046 | 99.141 |
| 1214.09 | 99.571 | 100.092 | 99.049 |
| 1214.51 | 99.563 | 100.054 | 99.073 |
| 1214.94 | 99.548 | 100.057 | 99.038 |
| 1215.58 | 99.475 | 100.007 | 98.943 |
| 1216.0 | 99.473 | 100.041 | 98.905 |
| 1216.43 | 99.475 | 100.054 | 98.897 |
| 1217.06 | 99.414 | 100.035 | 98.794 |
| 1217.48 | 99.404 | 100.029 | 98.779 |
| 1217.9 | 99.389 | 100.05 | 98.728 |
| 1218.53 | 99.361 | 100.082 | 98.641 |
| 1218.95 | 99.34 | 100.069 | 98.611 |
| 1219.58 | 99.274 | 100.026 | 98.522 |
| 1220.0 | 99.269 | 100.053 | 98.484 |
| 1220.41 | 99.243 | 100.05 | 98.435 |
| 1221.04 | 99.206 | 100.064 | 98.349 |
| 1221.45 | 99.15 | 100.014 | 98.287 |
| 1222.07 | 99.121 | 100.043 | 98.198 |
| 1222.48 | 99.094 | 100.054 | 98.135 |
| 1223.1 | 99.07 | 100.064 | 98.076 |
| 1223.51 | 99.017 | 100.045 | 97.99 |
| 1223.92 | 98.984 | 100.047 | 97.921 |
| 1224.53 | 98.946 | 100.04 | 97.852 |
| 1224.94 | 98.935 | 100.092 | 97.778 |
| 1225.55 | 98.843 | 100.018 | 97.667 |
| 1225.96 | 98.816 | 100.062 | 97.57 |
| 1226.57 | 98.764 | 100.027 | 97.5 |
| 1226.98 | 98.738 | 100.022 | 97.453 |
| 1227.58 | 98.679 | 100.02 | 97.339 |
| 1227.99 | 98.648 | 100.04 | 97.256 |
| 1228.59 | 98.607 | 100.047 | 97.167 |
| 1229.0 | 98.599 | 100.084 | 97.114 |
| 1229.6 | 98.518 | 100.05 | 96.986 |
| 1230.0 | 98.495 | 100.04 | 96.951 |
| 1230.6 | 98.452 | 100.075 | 96.829 |
| 1231.0 | 98.446 | 100.063 | 96.829 |
| 1231.6 | 98.397 | 100.059 | 96.734 |
| 1232.0 | 98.378 | 100.109 | 96.646 |
| 1232.6 | 98.312 | 100.04 | 96.585 |
| 1233.0 | 98.294 | 100.031 | 96.557 |
| 1233.6 | 98.267 | 100.069 | 96.464 |
| 1233.99 | 98.272 | 100.066 | 96.479 |
| 1234.59 | 98.214 | 100.032 | 96.397 |
| 1234.98 | 98.218 | 100.091 | 96.346 |
| 1235.58 | 98.177 | 100.063 | 96.291 |
| 1235.97 | 98.164 | 100.058 | 96.27 |
| 1236.57 | 98.15 | 100.054 | 96.246 |
| 1236.96 | 98.152 | 100.07 | 96.235 |
| 1237.56 | 98.132 | 100.075 | 96.189 |
| 1237.95 | 98.12 | 100.07 | 96.17 |
| 1238.54 | 98.082 | 100.037 | 96.128 |
| 1238.94 | 98.08 | 100.041 | 96.119 |
| 1239.53 | 98.073 | 100.045 | 96.101 |
| 1239.92 | 98.044 | 100.043 | 96.045 |
| 1240.51 | 98.04 | 99.998 | 96.083 |
| 1241.1 | 98.073 | 100.065 | 96.082 |
| 1241.5 | 98.05 | 100.028 | 96.072 |
| 1242.09 | 98.034 | 100.048 | 96.019 |
| 1242.48 | 98.065 | 100.081 | 96.05 |
| 1243.07 | 98.03 | 100.028 | 96.031 |
| 1243.46 | 98.054 | 100.082 | 96.025 |
| 1244.05 | 98.024 | 100.048 | 95.999 |
| 1244.44 | 98.023 | 100.035 | 96.011 |
| 1245.04 | 98.02 | 100.052 | 95.987 |
| 1245.43 | 98.02 | 100.053 | 95.987 |
| 1246.02 | 97.981 | 100.033 | 95.929 |
| 1246.41 | 98.006 | 100.081 | 95.93 |
| 1247.0 | 97.964 | 100.043 | 95.886 |
| 1247.59 | 97.947 | 100.037 | 95.856 |
| 1247.99 | 97.959 | 100.059 | 95.858 |
| 1248.58 | 97.915 | 100.035 | 95.796 |
| 1248.98 | 97.894 | 100.021 | 95.767 |
| 1249.57 | 97.895 | 100.052 | 95.739 |
| 1249.96 | 97.847 | 100.022 | 95.672 |
| 1250.56 | 97.839 | 100.056 | 95.622 |
| 1250.95 | 97.808 | 100.062 | 95.553 |
| 1251.55 | 97.749 | 100.044 | 95.455 |
| 1251.95 | 97.727 | 100.039 | 95.416 |
| 1252.54 | 97.67 | 100.031 | 95.309 |
| 1252.94 | 97.657 | 100.044 | 95.271 |
| 1253.54 | 97.595 | 100.059 | 95.132 |
| 1253.94 | 97.567 | 100.061 | 95.072 |
| 1254.53 | 97.481 | 100.043 | 94.92 |
| 1254.93 | 97.467 | 100.048 | 94.885 |
| 1255.53 | 97.35 | 100.015 | 94.684 |
| 1255.93 | 97.308 | 100.035 | 94.582 |
| 1256.54 | 97.224 | 100.057 | 94.39 |
| 1256.94 | 97.153 | 100.036 | 94.271 |
| 1257.54 | 97.061 | 100.035 | 94.087 |
| 1257.95 | 96.989 | 100.03 | 93.949 |
| 1258.55 | 96.901 | 100.031 | 93.772 |
| 1258.96 | 96.821 | 100.05 | 93.592 |
| 1259.56 | 96.694 | 100.01 | 93.377 |
| 1259.97 | 96.641 | 100.047 | 93.235 |
| 1260.58 | 96.519 | 100.04 | 92.998 |
| 1260.99 | 96.447 | 100.02 | 92.874 |
| 1261.6 | 96.35 | 100.022 | 92.679 |
| 1262.01 | 96.291 | 100.047 | 92.535 |
| 1262.42 | 96.212 | 100.044 | 92.381 |
| 1263.04 | 96.134 | 100.048 | 92.22 |
| 1263.45 | 96.061 | 100.041 | 92.08 |
| 1264.07 | 95.985 | 100.038 | 91.932 |
| 1264.48 | 95.928 | 100.038 | 91.819 |
| 1265.1 | 95.88 | 100.025 | 91.736 |
| 1265.51 | 95.833 | 99.998 | 91.668 |
| 1265.93 | 95.83 | 100.026 | 91.635 |
| 1266.56 | 95.801 | 100.03 | 91.573 |
| 1266.97 | 95.787 | 100.015 | 91.559 |
| 1267.6 | 95.789 | 100.044 | 91.533 |
| 1268.02 | 95.807 | 100.042 | 91.572 |
| 1268.44 | 95.805 | 100.022 | 91.587 |
| 1269.07 | 95.835 | 100.017 | 91.653 |
| 1269.49 | 95.889 | 100.027 | 91.751 |
| 1269.92 | 95.905 | 100.031 | 91.78 |
| 1270.55 | 95.97 | 100.011 | 91.929 |
| 1270.98 | 96.032 | 100.033 | 92.031 |
| 1271.41 | 96.072 | 100.007 | 92.137 |
| 1272.05 | 96.206 | 100.044 | 92.369 |
| 1272.47 | 96.263 | 100.043 | 92.483 |
| 1272.9 | 96.326 | 100.012 | 92.639 |
| 1273.55 | 96.458 | 100.021 | 92.895 |
| 1273.98 | 96.548 | 100.023 | 93.072 |
| 1274.41 | 96.638 | 100.028 | 93.248 |
| 1275.06 | 96.782 | 100.031 | 93.533 |
| 1275.5 | 96.893 | 100.03 | 93.757 |
| 1275.93 | 96.996 | 100.045 | 93.947 |
| 1276.59 | 97.154 | 100.022 | 94.286 |
| 1277.02 | 97.271 | 100.039 | 94.503 |
| 1277.46 | 97.399 | 100.038 | 94.759 |
| 1277.9 | 97.51 | 100.043 | 94.977 |
| 1278.56 | 97.661 | 100.036 | 95.286 |
| 1279.0 | 97.767 | 100.004 | 95.531 |
| 1279.45 | 97.88 | 100.032 | 95.727 |
| 1280.11 | 98.06 | 100.035 | 96.085 |
| 1280.56 | 98.153 | 100 | 96.306 |
| 1281.0 | 98.244 | 100.015 | 96.474 |
| 1281.45 | 98.364 | 100.032 | 96.696 |
| 1281.9 | 98.462 | 100.038 | 96.885 |
| 1282.57 | 98.592 | 100.037 | 97.147 |
| 1283.02 | 98.685 | 100.04 | 97.33 |
| 1283.47 | 98.762 | 100.035 | 97.488 |
| 1283.93 | 98.836 | 100.028 | 97.643 |
| 1284.61 | 98.942 | 100.045 | 97.84 |
| 1285.06 | 98.981 | 100.002 | 97.96 |
| 1285.52 | 99.037 | 100.029 | 98.044 |
| 1285.97 | 99.121 | 100.037 | 98.204 |
| 1286.43 | 99.158 | 100.008 | 98.308 |
| 1286.89 | 99.221 | 100.021 | 98.42 |
| 1287.58 | 99.277 | 100.035 | 98.518 |
| 1288.04 | 99.316 | 100.015 | 98.617 |
| 1288.5 | 99.373 | 100.021 | 98.725 |
| 1288.96 | 99.404 | 100.029 | 98.779 |
| 1289.43 | 99.438 | 100.005 | 98.872 |
| 1289.89 | 99.462 | 100.009 | 98.914 |
| 1290.59 | 99.505 | 100.014 | 98.997 |
| 1291.06 | 99.552 | 99.994 | 99.111 |
| 1291.52 | 99.588 | 100.07 | 99.105 |
| 1291.99 | 99.593 | 100.021 | 99.165 |
| 1292.46 | 99.606 | 100.022 | 99.189 |
| 1292.93 | 99.629 | 100.023 | 99.235 |
| 1293.4 | 99.657 | 100.007 | 99.307 |
| 1294.11 | 99.707 | 100.063 | 99.351 |
| 1294.59 | 99.697 | 100.012 | 99.382 |
| 1295.06 | 99.712 | 100.032 | 99.392 |
| 1295.54 | 99.721 | 100 | 99.443 |
| 1296.01 | 99.74 | 100.017 | 99.463 |
| 1296.49 | 99.721 | 99.981 | 99.461 |
| 1296.97 | 99.775 | 100.047 | 99.502 |
| 1297.45 | 99.77 | 100.024 | 99.515 |
| 1297.93 | 99.791 | 100.036 | 99.547 |
| 1298.41 | 99.798 | 100.031 | 99.566 |
| 1298.89 | 99.817 | 100.031 | 99.602 |
| 1299.61 | 99.798 | 100 | 99.597 |
| 1300.1 | 99.831 | 100.031 | 99.631 |
| 1300.58 | 99.844 | 100.02 | 99.668 |
| 1301.07 | 99.848 | 100.028 | 99.669 |
| 1301.55 | 99.851 | 100.017 | 99.685 |
| 1302.04 | 99.846 | 100.028 | 99.665 |
| 1302.53 | 99.857 | 100.003 | 99.711 |
| 1303.02 | 99.864 | 100.015 | 99.713 |
| 1303.51 | 99.877 | 100.035 | 99.718 |
| 1304.0 | 99.852 | 99.98 | 99.724 |
| 1304.49 | 99.894 | 100.016 | 99.771 |
| 1304.98 | 99.881 | 100.006 | 99.756 |
| 1305.47 | 99.907 | 100.018 | 99.796 |
| 1305.96 | 99.904 | 100.039 | 99.768 |
| 1306.46 | 99.896 | 100.023 | 99.769 |
| 1306.95 | 99.893 | 100.017 | 99.769 |
| 1307.45 | 99.907 | 100.013 | 99.801 |
| 1307.94 | 99.919 | 100.024 | 99.814 |
| 1308.44 | 99.911 | 99.983 | 99.838 |
| 1308.94 | 99.922 | 100.019 | 99.826 |
| 1309.43 | 99.924 | 100.006 | 99.841 |
| 1309.93 | 99.929 | 100.006 | 99.852 |
| 1310.43 | 99.923 | 99.992 | 99.855 |
| 1310.93 | 99.934 | 100.022 | 99.846 |
| 1311.43 | 99.929 | 99.995 | 99.863 |
| 1311.93 | 99.929 | 100.001 | 99.857 |
| 1312.43 | 99.958 | 100.023 | 99.892 |
| 1312.94 | 99.922 | 99.98 | 99.863 |
| 1313.44 | 99.926 | 99.987 | 99.865 |
| 1313.94 | 99.968 | 100.037 | 99.898 |
| 1314.44 | 99.951 | 99.966 | 99.935 |
| 1314.95 | 99.93 | 99.984 | 99.875 |
| 1315.45 | 99.969 | 100.073 | 99.865 |
| 1315.96 | 99.943 | 99.989 | 99.897 |
| 1316.47 | 99.954 | 100.01 | 99.898 |
| 1316.97 | 99.957 | 100.029 | 99.884 |
| 1317.48 | 99.961 | 100.007 | 99.915 |
| 1317.99 | 99.951 | 99.995 | 99.908 |
| 1318.49 | 99.941 | 99.978 | 99.904 |
| 1319.0 | 99.955 | 100 | 99.91 |
| 1319.51 | 99.954 | 100.011 | 99.897 |
| 1320.02 | 99.961 | 100.002 | 99.92 |
| 1320.53 | 99.956 | 99.996 | 99.917 |
| 1321.04 | 99.976 | 100.029 | 99.922 |
| 1321.55 | 99.947 | 99.971 | 99.922 |
| 1322.06 | 99.951 | 99.993 | 99.909 |
| 1322.57 | 99.957 | 99.968 | 99.946 |
| 1323.08 | 99.952 | 100.006 | 99.897 |
| 1323.59 | 99.974 | 100.012 | 99.935 |
| 1324.1 | 99.961 | 100.007 | 99.915 |
| 1324.61 | 99.943 | 99.961 | 99.925 |
| 1325.13 | 99.949 | 99.958 | 99.939 |
| 1325.38 | 99.942 | 99.949 | 99.934 |
| 1325.89 | 99.959 | 99.988 | 99.931 |
| 1326.41 | 99.955 | 99.958 | 99.951 |
| 1326.92 | 99.953 | 99.963 | 99.943 |
| 1327.43 | 99.969 | 99.977 | 99.96 |
| 1327.95 | 99.942 | 99.943 | 99.941 |
| 1328.46 | 99.95 | 99.952 | 99.949 |
| 1328.97 | 99.931 | 99.917 | 99.945 |
| 1329.49 | 99.917 | 99.884 | 99.949 |
| 1330.0 | 99.939 | 99.914 | 99.964 |
| 1330.51 | 99.949 | 99.922 | 99.976 |
| 1331.03 | 99.952 | 99.94 | 99.965 |
| 1331.54 | 99.916 | 99.874 | 99.958 |
| 1332.06 | 99.939 | 99.914 | 99.963 |
| 1332.57 | 99.93 | 99.875 | 99.985 |
| 1333.08 | 99.911 | 99.874 | 99.948 |
| 1333.6 | 99.926 | 99.889 | 99.964 |
| 1334.11 | 99.937 | 99.89 | 99.984 |
| 1334.63 | 99.908 | 99.836 | 99.98 |
| 1334.88 | 99.902 | 99.85 | 99.954 |
| 1335.4 | 99.914 | 99.884 | 99.944 |
| 1335.91 | 99.914 | 99.872 | 99.956 |
| 1336.43 | 99.928 | 99.887 | 99.97 |
| 1336.94 | 99.944 | 99.901 | 99.987 |
| 1337.45 | 99.936 | 99.906 | 99.965 |
| 1337.97 | 99.93 | 99.895 | 99.965 |
| 1338.48 | 99.926 | 99.9 | 99.952 |
| 1338.99 | 99.93 | 99.922 | 99.938 |
| 1339.51 | 99.929 | 99.901 | 99.957 |
| 1340.02 | 99.957 | 99.927 | 99.988 |
| 1340.53 | 99.919 | 99.901 | 99.937 |
| 1341.05 | 99.954 | 99.948 | 99.959 |
| 1341.56 | 99.957 | 99.952 | 99.962 |
| 1342.07 | 99.945 | 99.936 | 99.954 |
| 1342.58 | 99.941 | 99.939 | 99.943 |
| 1343.09 | 99.95 | 99.97 | 99.929 |
| 1343.61 | 99.957 | 99.966 | 99.949 |
| 1344.12 | 99.966 | 99.99 | 99.943 |
| 1344.63 | 99.958 | 99.957 | 99.958 |
| 1344.88 | 99.953 | 99.969 | 99.937 |
| 1345.39 | 99.956 | 99.981 | 99.93 |
| 1345.9 | 99.953 | 99.982 | 99.925 |
| 1346.41 | 99.975 | 99.997 | 99.953 |
| 1346.92 | 99.984 | 99.983 | 99.984 |
| 1347.43 | 99.969 | 100 | 99.938 |
| 1347.94 | 99.948 | 99.985 | 99.911 |
| 1348.45 | 99.972 | 99.995 | 99.948 |
| 1348.96 | 99.961 | 99.962 | 99.961 |
| 1349.46 | 99.974 | 100.007 | 99.942 |
| 1349.97 | 99.98 | 100.019 | 99.94 |
| 1350.48 | 99.965 | 100.007 | 99.923 |
| 1350.98 | 99.97 | 100.015 | 99.925 |
| 1351.49 | 99.947 | 99.984 | 99.911 |
| 1351.99 | 99.945 | 99.987 | 99.904 |
| 1352.5 | 99.938 | 99.977 | 99.899 |
| 1353.0 | 99.942 | 99.982 | 99.902 |
| 1353.5 | 99.952 | 99.995 | 99.91 |
| 1354.01 | 99.959 | 100.004 | 99.915 |
| 1354.51 | 99.927 | 99.96 | 99.894 |
| 1355.01 | 99.955 | 100.02 | 99.89 |
| 1355.51 | 99.906 | 99.964 | 99.848 |
| 1356.01 | 99.929 | 99.995 | 99.863 |
| 1356.51 | 99.932 | 99.996 | 99.869 |
| 1357.01 | 99.906 | 99.994 | 99.818 |
| 1357.51 | 99.931 | 99.965 | 99.897 |
| 1358.01 | 99.917 | 99.972 | 99.862 |
| 1358.5 | 99.909 | 99.971 | 99.846 |
| 1359.0 | 99.93 | 99.99 | 99.87 |
| 1359.5 | 99.908 | 99.982 | 99.833 |
| 1359.99 | 99.895 | 99.963 | 99.828 |
| 1360.48 | 99.899 | 99.948 | 99.851 |
| 1360.98 | 99.896 | 99.976 | 99.815 |
| 1361.47 | 99.884 | 99.974 | 99.794 |
| 1361.96 | 99.894 | 99.962 | 99.826 |
| 1362.45 | 99.921 | 100.02 | 99.821 |
| 1362.95 | 99.885 | 99.998 | 99.772 |
| 1363.44 | 99.878 | 99.968 | 99.788 |
| 1363.92 | 99.882 | 99.982 | 99.783 |
| 1364.41 | 99.855 | 99.955 | 99.755 |
| 1364.9 | 99.866 | 99.969 | 99.763 |
| 1365.39 | 99.872 | 99.978 | 99.766 |
| 1366.12 | 99.881 | 99.995 | 99.768 |
| 1366.6 | 99.853 | 99.974 | 99.732 |
| 1367.09 | 99.853 | 99.988 | 99.717 |
| 1367.57 | 99.848 | 99.984 | 99.711 |
| 1368.05 | 99.854 | 99.972 | 99.735 |
| 1368.53 | 99.866 | 99.997 | 99.735 |
| 1369.01 | 99.855 | 100.002 | 99.708 |
| 1369.49 | 99.846 | 99.996 | 99.697 |
| 1369.97 | 99.834 | 100.001 | 99.667 |
| 1370.45 | 99.856 | 100.018 | 99.693 |
| 1370.93 | 99.84 | 100.002 | 99.679 |
| 1371.4 | 99.818 | 99.96 | 99.675 |
| 1372.11 | 99.797 | 99.985 | 99.61 |
| 1372.59 | 99.809 | 99.971 | 99.647 |
| 1373.06 | 99.786 | 99.976 | 99.595 |
| 1373.53 | 99.803 | 99.999 | 99.608 |
| 1374.01 | 99.775 | 99.952 | 99.598 |
| 1374.48 | 99.774 | 100.006 | 99.542 |
| 1374.95 | 99.729 | 99.944 | 99.514 |
| 1375.41 | 99.761 | 99.987 | 99.534 |
| 1376.11 | 99.752 | 100 | 99.504 |
| 1376.58 | 99.738 | 99.987 | 99.489 |
| 1377.05 | 99.746 | 100.009 | 99.483 |
| 1377.51 | 99.719 | 99.996 | 99.443 |
| 1377.97 | 99.745 | 100.009 | 99.48 |
| 1378.44 | 99.715 | 99.981 | 99.449 |
| 1378.9 | 99.705 | 99.969 | 99.441 |
| 1379.59 | 99.681 | 99.967 | 99.395 |
| 1380.05 | 99.702 | 100.004 | 99.399 |
| 1380.5 | 99.687 | 99.961 | 99.414 |
| 1380.96 | 99.682 | 99.997 | 99.368 |
| 1381.42 | 99.618 | 99.924 | 99.313 |
| 1382.1 | 99.638 | 99.949 | 99.327 |
| 1382.55 | 99.67 | 99.989 | 99.351 |
| 1383.01 | 99.658 | 99.98 | 99.337 |
| 1383.46 | 99.644 | 99.996 | 99.292 |
| 1383.91 | 99.651 | 99.974 | 99.328 |
| 1384.58 | 99.613 | 99.933 | 99.294 |
| 1385.03 | 99.605 | 99.964 | 99.246 |
| 1385.48 | 99.631 | 99.975 | 99.286 |
| 1385.93 | 99.603 | 99.949 | 99.256 |
| 1386.59 | 99.588 | 99.947 | 99.228 |
| 1387.04 | 99.575 | 99.942 | 99.207 |
| 1387.48 | 99.583 | 99.937 | 99.23 |
| 1387.92 | 99.61 | 99.986 | 99.234 |
| 1388.58 | 99.593 | 99.965 | 99.221 |
| 1389.02 | 99.603 | 99.975 | 99.232 |
| 1389.46 | 99.59 | 99.963 | 99.218 |
| 1389.9 | 99.606 | 99.979 | 99.232 |
| 1390.56 | 99.616 | 100.02 | 99.213 |
| 1390.99 | 99.612 | 100.005 | 99.219 |
| 1391.43 | 99.586 | 99.985 | 99.187 |
| 1392.08 | 99.602 | 99.968 | 99.236 |
| 1392.51 | 99.612 | 100.001 | 99.222 |
| 1392.94 | 99.597 | 99.952 | 99.242 |
| 1393.59 | 99.61 | 99.973 | 99.247 |
| 1394.01 | 99.631 | 100.012 | 99.25 |
| 1394.44 | 99.616 | 99.991 | 99.242 |
| 1395.08 | 99.619 | 100.005 | 99.232 |
| 1395.51 | 99.625 | 99.989 | 99.262 |
| 1395.93 | 99.588 | 99.937 | 99.238 |
| 1396.57 | 99.643 | 100.01 | 99.275 |
| 1396.99 | 99.609 | 99.962 | 99.256 |
| 1397.42 | 99.645 | 100.023 | 99.266 |
| 1398.05 | 99.648 | 100.007 | 99.289 |
| 1398.47 | 99.655 | 99.989 | 99.32 |
| 1399.1 | 99.625 | 99.956 | 99.293 |
| 1399.52 | 99.642 | 99.967 | 99.317 |
| 1399.93 | 99.645 | 99.96 | 99.329 |
| 1400.56 | 99.661 | 99.978 | 99.344 |
| 1400.97 | 99.687 | 100.025 | 99.349 |
| 1401.59 | 99.677 | 99.976 | 99.378 |
| 1402.01 | 99.711 | 99.993 | 99.429 |
| 1402.42 | 99.688 | 99.983 | 99.394 |
| 1403.04 | 99.693 | 99.971 | 99.415 |
| 1403.45 | 99.715 | 100.003 | 99.427 |
| 1404.06 | 99.711 | 99.962 | 99.459 |
| 1404.47 | 99.702 | 99.964 | 99.441 |
| 1405.09 | 99.713 | 99.986 | 99.439 |
| 1405.49 | 99.719 | 99.982 | 99.455 |
| 1406.1 | 99.752 | 100.006 | 99.497 |
| 1406.51 | 99.721 | 99.966 | 99.475 |
| 1406.91 | 99.735 | 99.985 | 99.485 |
| 1407.52 | 99.744 | 99.96 | 99.528 |
| 1407.93 | 99.73 | 99.971 | 99.488 |
| 1408.53 | 99.755 | 99.975 | 99.535 |
| 1408.93 | 99.764 | 99.962 | 99.566 |
| 1409.53 | 99.77 | 99.991 | 99.549 |
| 1409.94 | 99.772 | 99.975 | 99.568 |
| 1410.54 | 99.758 | 99.951 | 99.565 |
| 1410.94 | 99.764 | 99.979 | 99.549 |
| 1411.53 | 99.802 | 100.007 | 99.597 |
| 1411.93 | 99.812 | 100.019 | 99.606 |
| 1412.53 | 99.803 | 99.978 | 99.627 |
| 1412.93 | 99.79 | 99.973 | 99.606 |
| 1413.52 | 99.801 | 99.942 | 99.66 |
| 1413.92 | 99.82 | 99.972 | 99.669 |
| 1414.51 | 99.846 | 99.988 | 99.704 |
| 1414.91 | 99.839 | 100.007 | 99.671 |
| 1415.5 | 99.833 | 99.987 | 99.679 |
| 1416.09 | 99.846 | 99.974 | 99.718 |
| 1416.49 | 99.848 | 100.003 | 99.693 |
| 1417.08 | 99.811 | 99.949 | 99.672 |
| 1417.47 | 99.841 | 99.993 | 99.689 |
| 1418.06 | 99.841 | 99.984 | 99.697 |
| 1418.45 | 99.841 | 99.955 | 99.727 |
| 1419.04 | 99.865 | 100.018 | 99.711 |
| 1419.43 | 99.829 | 99.941 | 99.717 |
| 1420.02 | 99.87 | 99.99 | 99.749 |
| 1420.41 | 99.864 | 99.98 | 99.748 |
| 1421.0 | 99.865 | 99.988 | 99.741 |
| 1421.59 | 99.873 | 100.002 | 99.743 |
| 1421.98 | 99.879 | 99.984 | 99.773 |
| 1422.56 | 99.868 | 99.978 | 99.758 |
| 1422.96 | 99.903 | 100.01 | 99.795 |
| 1423.54 | 99.903 | 99.982 | 99.823 |
| 1423.93 | 99.861 | 99.94 | 99.781 |
| 1424.52 | 99.876 | 99.952 | 99.801 |
| 1424.91 | 99.88 | 99.965 | 99.796 |
| 1425.5 | 99.895 | 99.979 | 99.812 |
| 1426.08 | 99.885 | 99.965 | 99.805 |
| 1426.47 | 99.899 | 99.978 | 99.819 |
| 1427.06 | 99.861 | 99.934 | 99.787 |
| 1427.45 | 99.871 | 99.964 | 99.778 |
| 1428.04 | 99.862 | 99.94 | 99.785 |
| 1428.43 | 99.883 | 99.934 | 99.831 |
| 1429.02 | 99.881 | 99.95 | 99.813 |
| 1429.41 | 99.884 | 99.938 | 99.83 |
| 1430.0 | 99.901 | 99.954 | 99.848 |
| 1430.59 | 99.875 | 99.915 | 99.834 |
| 1430.98 | 99.891 | 99.941 | 99.841 |
| 1431.57 | 99.887 | 99.937 | 99.836 |
| 1431.96 | 99.924 | 99.978 | 99.869 |
| 1432.56 | 99.877 | 99.916 | 99.838 |
| 1432.95 | 99.876 | 99.912 | 99.839 |
| 1433.54 | 99.884 | 99.915 | 99.853 |
| 1433.94 | 99.899 | 99.93 | 99.868 |
| 1434.53 | 99.896 | 99.909 | 99.883 |
| 1434.93 | 99.897 | 99.933 | 99.861 |
| 1435.52 | 99.882 | 99.872 | 99.891 |
| 1435.92 | 99.885 | 99.916 | 99.854 |
| 1436.51 | 99.875 | 99.887 | 99.863 |
| 1436.91 | 99.894 | 99.894 | 99.893 |
| 1437.51 | 99.864 | 99.87 | 99.858 |
| 1437.91 | 99.878 | 99.896 | 99.86 |
| 1438.51 | 99.87 | 99.872 | 99.867 |
| 1438.91 | 99.842 | 99.827 | 99.857 |
| 1439.51 | 99.894 | 99.886 | 99.903 |
| 1439.91 | 99.877 | 99.88 | 99.874 |
| 1440.52 | 99.861 | 99.842 | 99.88 |
| 1440.92 | 99.862 | 99.849 | 99.875 |
| 1441.53 | 99.894 | 99.896 | 99.891 |
| 1441.93 | 99.869 | 99.849 | 99.889 |
| 1442.54 | 99.848 | 99.811 | 99.885 |
| 1442.95 | 99.858 | 99.826 | 99.89 |
| 1443.56 | 99.863 | 99.847 | 99.879 |
| 1443.97 | 99.865 | 99.818 | 99.913 |
| 1444.58 | 99.854 | 99.833 | 99.875 |
| 1444.99 | 99.845 | 99.845 | 99.845 |
| 1445.6 | 99.855 | 99.817 | 99.893 |
| 1446.02 | 99.848 | 99.811 | 99.885 |
| 1446.43 | 99.848 | 99.802 | 99.894 |
| 1447.05 | 99.832 | 99.802 | 99.861 |
| 1447.46 | 99.858 | 99.818 | 99.898 |
| 1448.08 | 99.893 | 99.866 | 99.919 |
| 1448.5 | 99.842 | 99.833 | 99.851 |
| 1448.92 | 99.842 | 99.803 | 99.881 |
| 1449.54 | 99.835 | 99.801 | 99.868 |
| 1449.96 | 99.867 | 99.858 | 99.876 |
| 1450.59 | 99.848 | 99.814 | 99.882 |
| 1451.01 | 99.867 | 99.875 | 99.859 |
| 1451.43 | 99.851 | 99.851 | 99.852 |
| 1452.07 | 99.842 | 99.819 | 99.864 |
| 1452.49 | 99.859 | 99.827 | 99.891 |
| 1452.91 | 99.852 | 99.825 | 99.879 |
| 1453.55 | 99.867 | 99.859 | 99.874 |
| 1453.98 | 99.864 | 99.844 | 99.884 |
| 1454.41 | 99.835 | 99.834 | 99.835 |
| 1455.05 | 99.866 | 99.877 | 99.855 |
| 1455.48 | 99.88 | 99.883 | 99.877 |
| 1455.91 | 99.876 | 99.867 | 99.885 |
| 1456.56 | 99.877 | 99.859 | 99.895 |
| 1456.99 | 99.88 | 99.893 | 99.866 |
| 1457.42 | 99.872 | 99.879 | 99.864 |
| 1458.08 | 99.864 | 99.893 | 99.836 |
| 1458.51 | 99.892 | 99.934 | 99.85 |
| 1458.95 | 99.887 | 99.902 | 99.873 |
| 1459.61 | 99.88 | 99.925 | 99.834 |
| 1460.05 | 99.886 | 99.916 | 99.856 |
| 1460.49 | 99.888 | 99.925 | 99.852 |
| 1460.93 | 99.89 | 99.917 | 99.863 |
| 1461.59 | 99.874 | 99.913 | 99.836 |
| 1462.03 | 99.874 | 99.892 | 99.856 |
| 1462.48 | 99.882 | 99.934 | 99.831 |
| 1462.92 | 99.898 | 99.965 | 99.832 |
| 1463.59 | 99.902 | 99.966 | 99.837 |
| 1464.04 | 99.872 | 99.936 | 99.807 |
| 1464.49 | 99.892 | 99.965 | 99.818 |
| 1464.94 | 99.885 | 99.977 | 99.792 |
| 1465.39 | 99.896 | 99.96 | 99.832 |
| 1466.07 | 99.884 | 99.957 | 99.81 |
| 1466.52 | 99.885 | 99.965 | 99.805 |
| 1466.97 | 99.884 | 99.954 | 99.815 |
| 1467.43 | 99.867 | 99.939 | 99.795 |
| 1468.11 | 99.872 | 99.972 | 99.772 |
| 1468.57 | 99.879 | 99.942 | 99.816 |
| 1469.03 | 99.894 | 100.002 | 99.787 |
| 1469.49 | 99.877 | 99.986 | 99.769 |
| 1469.95 | 99.888 | 99.971 | 99.805 |
| 1470.41 | 99.875 | 99.965 | 99.786 |
| 1471.1 | 99.89 | 99.957 | 99.824 |
| 1471.57 | 99.879 | 99.999 | 99.76 |
| 1472.03 | 99.879 | 99.96 | 99.798 |
| 1472.49 | 99.866 | 99.963 | 99.769 |
| 1472.96 | 99.867 | 99.994 | 99.739 |
| 1473.43 | 99.868 | 99.966 | 99.77 |
| 1473.9 | 99.85 | 99.96 | 99.74 |
| 1474.6 | 99.887 | 99.996 | 99.779 |
| 1475.07 | 99.864 | 99.969 | 99.758 |
| 1475.54 | 99.86 | 99.966 | 99.753 |
| 1476.01 | 99.866 | 99.972 | 99.761 |
| 1476.49 | 99.827 | 99.923 | 99.731 |
| 1476.96 | 99.834 | 99.956 | 99.711 |
| 1477.43 | 99.834 | 99.952 | 99.716 |
| 1477.91 | 99.853 | 99.978 | 99.729 |
| 1478.39 | 99.817 | 99.925 | 99.708 |
| 1479.1 | 99.853 | 100.001 | 99.704 |
| 1479.58 | 99.827 | 99.958 | 99.695 |
| 1480.06 | 99.83 | 99.988 | 99.672 |
| 1480.54 | 99.839 | 99.973 | 99.705 |
| 1481.02 | 99.802 | 99.959 | 99.644 |
| 1481.5 | 99.801 | 99.928 | 99.674 |
| 1481.99 | 99.835 | 100.009 | 99.662 |
| 1482.47 | 99.811 | 99.961 | 99.66 |
| 1482.95 | 99.796 | 99.952 | 99.639 |
| 1483.44 | 99.79 | 99.963 | 99.617 |
| 1483.92 | 99.79 | 99.96 | 99.619 |
| 1484.41 | 99.783 | 99.952 | 99.615 |
| 1484.9 | 99.787 | 99.981 | 99.594 |
| 1485.39 | 99.798 | 99.998 | 99.598 |
| 1486.12 | 99.773 | 99.953 | 99.594 |
| 1486.61 | 99.788 | 99.973 | 99.603 |
| 1487.1 | 99.777 | 99.975 | 99.579 |
| 1487.59 | 99.77 | 99.964 | 99.575 |
| 1488.09 | 99.764 | 99.975 | 99.552 |
| 1488.58 | 99.758 | 99.959 | 99.557 |
| 1489.07 | 99.721 | 99.949 | 99.492 |
| 1489.57 | 99.718 | 99.922 | 99.514 |
| 1490.06 | 99.729 | 99.973 | 99.486 |
| 1490.56 | 99.717 | 99.951 | 99.483 |
| 1491.05 | 99.696 | 99.935 | 99.458 |
| 1491.55 | 99.715 | 99.964 | 99.466 |
| 1492.05 | 99.695 | 99.951 | 99.438 |
| 1492.54 | 99.7 | 99.948 | 99.452 |
| 1493.04 | 99.694 | 99.967 | 99.421 |
| 1493.54 | 99.697 | 100.003 | 99.39 |
| 1494.04 | 99.692 | 99.983 | 99.4 |
| 1494.54 | 99.675 | 99.955 | 99.396 |
| 1495.04 | 99.657 | 99.949 | 99.365 |
| 1495.54 | 99.659 | 99.972 | 99.346 |
| 1496.05 | 99.672 | 100.017 | 99.327 |
| 1496.55 | 99.66 | 100.005 | 99.315 |
| 1497.05 | 99.628 | 99.966 | 99.289 |
| 1497.56 | 99.641 | 100.007 | 99.275 |
| 1498.06 | 99.62 | 99.961 | 99.28 |
| 1498.56 | 99.608 | 100.001 | 99.215 |
| 1499.07 | 99.603 | 99.984 | 99.222 |
| 1499.57 | 99.583 | 99.968 | 99.198 |
| 1500.08 | 99.58 | 99.984 | 99.175 |
| 1500.59 | 99.56 | 99.975 | 99.145 |
| 1501.09 | 99.555 | 99.969 | 99.141 |
| 1501.6 | 99.534 | 99.953 | 99.115 |
| 1502.11 | 99.53 | 99.961 | 99.1 |
| 1502.61 | 99.509 | 99.978 | 99.041 |
| 1503.12 | 99.504 | 99.97 | 99.039 |
| 1503.63 | 99.494 | 99.98 | 99.008 |
| 1503.88 | 99.48 | 99.978 | 98.981 |
| 1504.39 | 99.474 | 99.949 | 98.998 |
| 1504.9 | 99.456 | 99.964 | 98.948 |
| 1505.41 | 99.431 | 99.969 | 98.892 |
| 1505.92 | 99.428 | 99.971 | 98.886 |
| 1506.43 | 99.407 | 99.95 | 98.864 |
| 1506.94 | 99.401 | 99.974 | 98.827 |
| 1507.45 | 99.378 | 99.99 | 98.767 |
| 1507.96 | 99.378 | 99.997 | 98.759 |
| 1508.47 | 99.331 | 99.929 | 98.732 |
| 1508.98 | 99.33 | 99.987 | 98.673 |
| 1509.49 | 99.313 | 99.976 | 98.65 |
| 1510.0 | 99.29 | 99.983 | 98.598 |
| 1510.51 | 99.294 | 99.995 | 98.593 |
| 1511.02 | 99.264 | 99.995 | 98.532 |
| 1511.54 | 99.235 | 99.984 | 98.485 |
| 1512.05 | 99.234 | 99.987 | 98.481 |
| 1512.56 | 99.192 | 99.964 | 98.42 |
| 1513.07 | 99.153 | 99.95 | 98.356 |
| 1513.58 | 99.157 | 99.983 | 98.33 |
| 1514.09 | 99.135 | 99.983 | 98.287 |
| 1514.6 | 99.126 | 99.97 | 98.282 |
| 1515.12 | 99.079 | 99.936 | 98.223 |
| 1515.63 | 99.067 | 99.985 | 98.149 |
| 1515.88 | 99.036 | 99.944 | 98.128 |
| 1516.39 | 99.044 | 99.999 | 98.089 |
| 1516.91 | 99.023 | 99.989 | 98.056 |
| 1517.42 | 98.982 | 99.974 | 97.989 |
| 1517.93 | 98.962 | 99.976 | 97.949 |
| 1518.44 | 98.936 | 99.981 | 97.892 |
| 1518.95 | 98.907 | 99.968 | 97.845 |
| 1519.46 | 98.878 | 99.966 | 97.79 |
| 1519.97 | 98.864 | 99.976 | 97.753 |
| 1520.48 | 98.8 | 99.93 | 97.669 |
| 1520.99 | 98.777 | 99.938 | 97.617 |
| 1521.5 | 98.761 | 99.977 | 97.545 |
| 1522.01 | 98.743 | 99.964 | 97.521 |
| 1522.52 | 98.718 | 99.98 | 97.456 |
| 1523.03 | 98.691 | 99.972 | 97.411 |
| 1523.54 | 98.652 | 99.973 | 97.332 |
| 1524.05 | 98.62 | 99.959 | 97.282 |
| 1524.56 | 98.598 | 99.961 | 97.235 |
| 1525.07 | 98.548 | 99.965 | 97.131 |
| 1525.57 | 98.557 | 99.972 | 97.143 |
| 1526.08 | 98.51 | 99.934 | 97.086 |
| 1526.59 | 98.493 | 99.982 | 97.005 |
| 1527.1 | 98.429 | 99.919 | 96.939 |
| 1527.6 | 98.418 | 99.92 | 96.915 |
| 1528.11 | 98.406 | 99.986 | 96.826 |
| 1528.61 | 98.358 | 99.934 | 96.783 |
| 1529.12 | 98.315 | 99.94 | 96.689 |
| 1529.62 | 98.316 | 99.979 | 96.653 |
| 1529.88 | 98.279 | 99.915 | 96.642 |
| 1530.38 | 98.251 | 99.924 | 96.578 |
| 1530.88 | 98.244 | 99.967 | 96.521 |
| 1531.39 | 98.21 | 99.94 | 96.479 |
| 1531.89 | 98.218 | 99.979 | 96.458 |
| 1532.39 | 98.188 | 99.971 | 96.404 |
| 1532.9 | 98.168 | 99.967 | 96.369 |
| 1533.4 | 98.123 | 99.936 | 96.311 |
| 1533.9 | 98.1 | 99.974 | 96.227 |
| 1534.4 | 98.093 | 99.94 | 96.246 |
| 1534.9 | 98.066 | 99.966 | 96.166 |
| 1535.4 | 98.064 | 99.997 | 96.132 |
| 1535.89 | 98.036 | 99.957 | 96.115 |
| 1536.39 | 98.012 | 99.947 | 96.077 |
| 1536.89 | 97.992 | 99.933 | 96.051 |
| 1537.39 | 97.957 | 99.918 | 95.996 |
| 1537.88 | 97.951 | 99.923 | 95.98 |
| 1538.38 | 97.94 | 99.939 | 95.941 |
| 1539.12 | 97.909 | 99.931 | 95.887 |
| 1539.61 | 97.902 | 99.938 | 95.866 |
| 1540.11 | 97.883 | 99.938 | 95.827 |
| 1540.6 | 97.884 | 99.931 | 95.836 |
| 1541.09 | 97.875 | 99.946 | 95.803 |
| 1541.58 | 97.868 | 99.987 | 95.75 |
| 1542.07 | 97.862 | 99.977 | 95.748 |
| 1542.56 | 97.835 | 99.95 | 95.72 |
| 1543.05 | 97.832 | 99.933 | 95.731 |
| 1543.54 | 97.849 | 99.988 | 95.71 |
| 1544.02 | 97.843 | 99.984 | 95.702 |
| 1544.51 | 97.79 | 99.914 | 95.666 |
| 1545.0 | 97.786 | 99.92 | 95.652 |
| 1545.48 | 97.801 | 99.922 | 95.68 |
| 1545.97 | 97.796 | 99.948 | 95.643 |
| 1546.45 | 97.789 | 99.92 | 95.658 |
| 1546.93 | 97.794 | 99.941 | 95.648 |
| 1547.41 | 97.789 | 99.947 | 95.63 |
| 1547.89 | 97.763 | 99.901 | 95.626 |
| 1548.61 | 97.802 | 99.956 | 95.649 |
| 1549.09 | 97.781 | 99.933 | 95.629 |
| 1549.57 | 97.784 | 99.921 | 95.648 |
| 1550.05 | 97.795 | 99.948 | 95.642 |
| 1550.52 | 97.791 | 99.938 | 95.644 |
| 1551.0 | 97.785 | 99.933 | 95.636 |
| 1551.47 | 97.774 | 99.915 | 95.634 |
| 1551.95 | 97.799 | 99.945 | 95.652 |
| 1552.42 | 97.789 | 99.922 | 95.655 |
| 1552.89 | 97.787 | 99.924 | 95.65 |
| 1553.6 | 97.784 | 99.91 | 95.657 |
| 1554.07 | 97.791 | 99.919 | 95.663 |
| 1554.53 | 97.774 | 99.888 | 95.66 |
| 1555.0 | 97.798 | 99.917 | 95.678 |
| 1555.47 | 97.774 | 99.9 | 95.648 |
| 1555.93 | 97.78 | 99.879 | 95.682 |
| 1556.4 | 97.786 | 99.879 | 95.694 |
| 1557.09 | 97.8 | 99.888 | 95.713 |
| 1557.56 | 97.82 | 99.925 | 95.714 |
| 1558.02 | 97.805 | 99.92 | 95.691 |
| 1558.48 | 97.807 | 99.906 | 95.708 |
| 1558.94 | 97.794 | 99.88 | 95.707 |
| 1559.4 | 97.805 | 99.913 | 95.698 |
| 1560.08 | 97.777 | 99.867 | 95.686 |
| 1560.54 | 97.786 | 99.901 | 95.671 |
| 1560.99 | 97.789 | 99.884 | 95.694 |
| 1561.45 | 97.801 | 99.883 | 95.719 |
| 1561.9 | 97.771 | 99.854 | 95.689 |
| 1562.58 | 97.786 | 99.868 | 95.704 |
| 1563.03 | 97.779 | 99.864 | 95.694 |
| 1563.48 | 97.796 | 99.902 | 95.69 |
| 1563.93 | 97.768 | 99.831 | 95.705 |
| 1564.6 | 97.789 | 99.855 | 95.723 |
| 1565.05 | 97.769 | 99.881 | 95.657 |
| 1565.49 | 97.78 | 99.863 | 95.698 |
| 1565.94 | 97.78 | 99.858 | 95.702 |
| 1566.6 | 97.764 | 99.85 | 95.679 |
| 1567.04 | 97.775 | 99.851 | 95.7 |
| 1567.49 | 97.767 | 99.866 | 95.668 |
| 1567.93 | 97.764 | 99.859 | 95.669 |
| 1568.58 | 97.757 | 99.835 | 95.679 |
| 1569.02 | 97.729 | 99.806 | 95.652 |
| 1569.46 | 97.75 | 99.836 | 95.664 |
| 1570.11 | 97.718 | 99.822 | 95.613 |
| 1570.55 | 97.727 | 99.833 | 95.62 |
| 1570.98 | 97.717 | 99.828 | 95.605 |
| 1571.41 | 97.694 | 99.798 | 95.59 |
| 1572.06 | 97.669 | 99.763 | 95.576 |
| 1572.49 | 97.673 | 99.784 | 95.562 |
| 1572.92 | 97.662 | 99.792 | 95.531 |
| 1573.56 | 97.653 | 99.775 | 95.531 |
| 1573.99 | 97.598 | 99.714 | 95.482 |
| 1574.42 | 97.625 | 99.739 | 95.512 |
| 1575.05 | 97.598 | 99.745 | 95.451 |
| 1575.48 | 97.586 | 99.717 | 95.455 |
| 1575.9 | 97.592 | 99.724 | 95.459 |
| 1576.54 | 97.578 | 99.753 | 95.404 |
| 1576.96 | 97.557 | 99.705 | 95.409 |
| 1577.59 | 97.534 | 99.699 | 95.369 |
| 1578.01 | 97.513 | 99.677 | 95.349 |
| 1578.42 | 97.487 | 99.692 | 95.282 |
| 1579.05 | 97.463 | 99.641 | 95.286 |
| 1579.47 | 97.475 | 99.688 | 95.262 |
| 1580.09 | 97.422 | 99.623 | 95.221 |
| 1580.5 | 97.384 | 99.6 | 95.167 |
| 1580.92 | 97.369 | 99.605 | 95.134 |
| 1581.53 | 97.35 | 99.597 | 95.104 |
| 1581.95 | 97.318 | 99.577 | 95.059 |
| 1582.56 | 97.287 | 99.534 | 95.04 |
| 1582.97 | 97.258 | 99.505 | 95.01 |
| 1583.58 | 97.217 | 99.484 | 94.949 |
| 1583.99 | 97.221 | 99.511 | 94.931 |
| 1584.6 | 97.169 | 99.47 | 94.868 |
| 1585.01 | 97.153 | 99.443 | 94.864 |
| 1585.41 | 97.094 | 99.406 | 94.781 |
| 1586.02 | 97.065 | 99.423 | 94.708 |
| 1586.42 | 97.043 | 99.391 | 94.695 |
| 1587.03 | 97.016 | 99.399 | 94.633 |
| 1587.43 | 96.947 | 99.347 | 94.547 |
| 1588.03 | 96.941 | 99.36 | 94.522 |
| 1588.43 | 96.881 | 99.286 | 94.475 |
| 1589.03 | 96.816 | 99.259 | 94.373 |
| 1589.43 | 96.83 | 99.283 | 94.377 |
| 1590.03 | 96.776 | 99.262 | 94.291 |
| 1590.43 | 96.74 | 99.272 | 94.209 |
| 1591.02 | 96.691 | 99.248 | 94.134 |
| 1591.42 | 96.638 | 99.187 | 94.089 |
| 1592.01 | 96.598 | 99.222 | 93.975 |
| 1592.41 | 96.563 | 99.216 | 93.91 |
| 1593.0 | 96.501 | 99.165 | 93.837 |
| 1593.59 | 96.442 | 99.158 | 93.726 |
| 1593.98 | 96.426 | 99.179 | 93.674 |
| 1594.57 | 96.358 | 99.161 | 93.555 |
| 1594.97 | 96.31 | 99.146 | 93.474 |
| 1595.56 | 96.247 | 99.139 | 93.354 |
| 1595.95 | 96.215 | 99.117 | 93.313 |
| 1596.53 | 96.135 | 99.118 | 93.152 |
| 1596.93 | 96.109 | 99.154 | 93.064 |
| 1597.51 | 96.049 | 99.135 | 92.963 |
| 1598.1 | 95.989 | 99.173 | 92.805 |
| 1598.49 | 95.949 | 99.161 | 92.736 |
| 1599.07 | 95.872 | 99.15 | 92.595 |
| 1599.46 | 95.837 | 99.155 | 92.519 |
| 1600.04 | 95.739 | 99.131 | 92.348 |